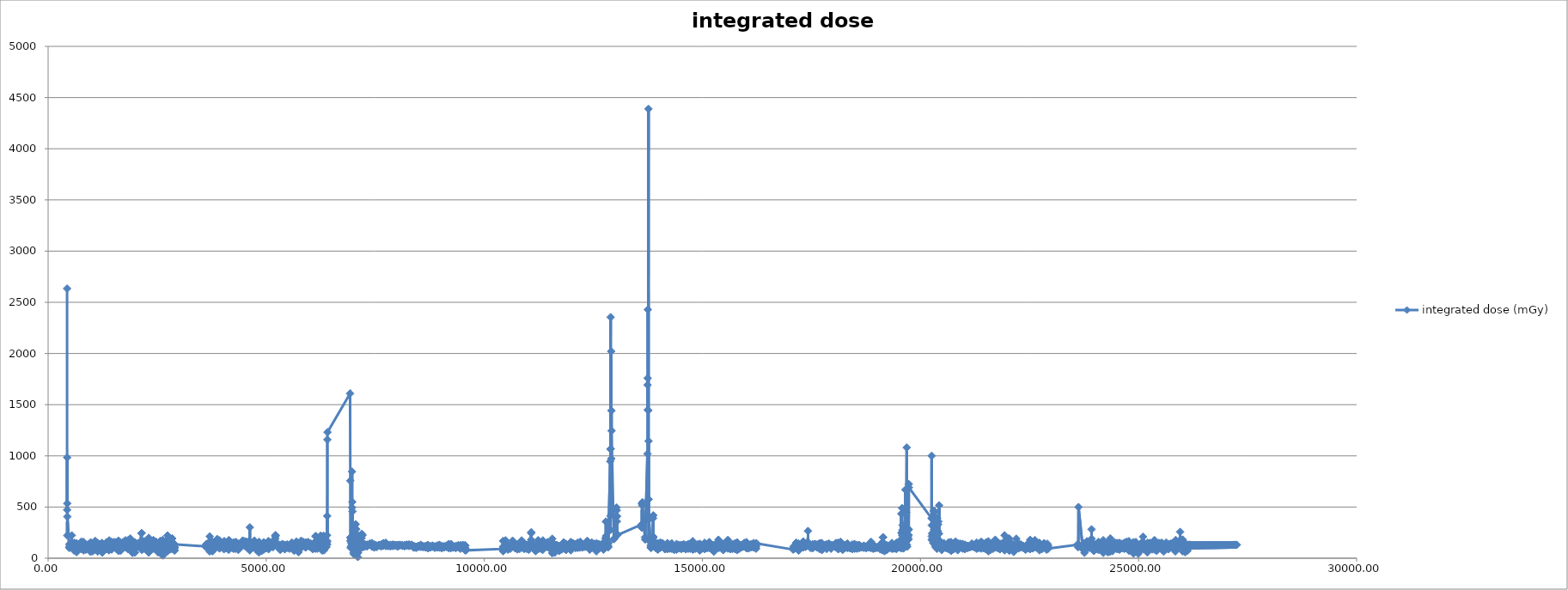
| Category | integrated dose (mGy) |
|---|---|
| 434.416 | 2634.265 |
| 435.828 | 471.512 |
| 436.828 | 983.38 |
| 439.0 | 534.577 |
| 439.071 | 222.272 |
| 441.571 | 406.166 |
| 486.051 | 101.11 |
| 489.141 | 133.559 |
| 490.051 | 104.992 |
| 491.251 | 139.493 |
| 492.551 | 112.292 |
| 495.051 | 115.567 |
| 539.51 | 121.699 |
| 542.591 | 223.087 |
| 543.501 | 123.056 |
| 544.701 | 136.251 |
| 546.001 | 143.438 |
| 548.501 | 109.413 |
| 592.951 | 75.959 |
| 596.041 | 115.371 |
| 596.951 | 112.439 |
| 598.151 | 100.381 |
| 599.451 | 150.574 |
| 601.951 | 124.471 |
| 646.401 | 120.084 |
| 649.491 | 145.872 |
| 650.401 | 138.666 |
| 651.601 | 118.229 |
| 652.901 | 59.514 |
| 655.401 | 140.295 |
| 699.851 | 118.128 |
| 702.941 | 101.698 |
| 703.851 | 112.302 |
| 705.051 | 103.639 |
| 706.351 | 102.604 |
| 708.851 | 88.791 |
| 753.301 | 112.662 |
| 756.391 | 117.782 |
| 757.301 | 160.199 |
| 758.501 | 100.605 |
| 759.801 | 89.321 |
| 762.301 | 160.143 |
| 806.751 | 159.998 |
| 809.841 | 145.849 |
| 810.751 | 143.346 |
| 811.951 | 76.221 |
| 813.251 | 105.544 |
| 815.751 | 107.265 |
| 860.201 | 103.504 |
| 863.291 | 82.973 |
| 864.201 | 90.004 |
| 865.401 | 129.115 |
| 866.701 | 133.452 |
| 869.201 | 92.039 |
| 913.651 | 130.34 |
| 916.741 | 89.072 |
| 917.651 | 96.466 |
| 918.851 | 98.555 |
| 920.151 | 134.952 |
| 922.651 | 125.811 |
| 967.101 | 113.897 |
| 970.191 | 137.633 |
| 971.101 | 95.167 |
| 972.301 | 139.3 |
| 973.601 | 62.251 |
| 976.101 | 155.574 |
| 1020.551 | 141.674 |
| 1023.641 | 134.713 |
| 1024.551 | 67.525 |
| 1025.751 | 132.56 |
| 1027.051 | 142.817 |
| 1029.551 | 81.951 |
| 1074.001 | 85.234 |
| 1077.091 | 127.6 |
| 1078.001 | 148.004 |
| 1079.201 | 165.537 |
| 1080.501 | 168.222 |
| 1083.001 | 137.644 |
| 1127.451 | 93.606 |
| 1130.541 | 128.58 |
| 1131.451 | 77.428 |
| 1132.651 | 143.335 |
| 1133.951 | 149.246 |
| 1136.451 | 65.368 |
| 1180.901 | 138.966 |
| 1183.991 | 106.212 |
| 1184.901 | 128.62 |
| 1186.101 | 95.247 |
| 1187.401 | 111.777 |
| 1189.901 | 79.179 |
| 1234.351 | 149.757 |
| 1237.441 | 129.431 |
| 1238.351 | 116.01 |
| 1239.551 | 113.458 |
| 1240.851 | 91.842 |
| 1243.351 | 54.996 |
| 1287.801 | 106.175 |
| 1290.891 | 102.723 |
| 1291.801 | 123.551 |
| 1293.001 | 132.675 |
| 1294.301 | 115.482 |
| 1296.801 | 118.488 |
| 1341.251 | 156.964 |
| 1344.341 | 90.107 |
| 1345.251 | 104.69 |
| 1346.451 | 89.968 |
| 1347.751 | 106.324 |
| 1350.251 | 120.274 |
| 1394.701 | 77.025 |
| 1397.791 | 163.706 |
| 1398.701 | 88.13 |
| 1399.901 | 86.082 |
| 1401.201 | 174.275 |
| 1403.701 | 112.549 |
| 1448.151 | 160.455 |
| 1451.241 | 104.278 |
| 1452.151 | 127.108 |
| 1453.351 | 130.939 |
| 1454.651 | 90.383 |
| 1457.151 | 85.223 |
| 1501.601 | 133.005 |
| 1504.691 | 136.102 |
| 1505.601 | 105.733 |
| 1506.801 | 132.096 |
| 1508.101 | 141.842 |
| 1510.601 | 157.438 |
| 1555.051 | 125.566 |
| 1558.141 | 157.466 |
| 1559.051 | 115.36 |
| 1560.251 | 137.221 |
| 1561.551 | 132.189 |
| 1564.051 | 90.765 |
| 1608.501 | 89.423 |
| 1611.591 | 71.746 |
| 1612.501 | 171.17 |
| 1613.701 | 82.844 |
| 1615.001 | 140.551 |
| 1617.501 | 74.773 |
| 1661.951 | 72.735 |
| 1665.041 | 137.62 |
| 1665.951 | 136.028 |
| 1667.151 | 152.172 |
| 1668.451 | 133.041 |
| 1670.951 | 135.709 |
| 1715.401 | 151.791 |
| 1718.491 | 124.335 |
| 1719.401 | 121.189 |
| 1720.601 | 157.244 |
| 1721.901 | 117.234 |
| 1724.401 | 146.467 |
| 1768.851 | 117.725 |
| 1771.941 | 113.981 |
| 1772.851 | 175.276 |
| 1774.051 | 109.582 |
| 1775.351 | 142.746 |
| 1777.851 | 104.616 |
| 1822.301 | 102.09 |
| 1825.391 | 156.002 |
| 1826.301 | 95.481 |
| 1827.501 | 163.291 |
| 1828.801 | 90.033 |
| 1831.301 | 175.285 |
| 1875.751 | 129.774 |
| 1878.841 | 87.259 |
| 1879.751 | 128.766 |
| 1880.951 | 167.907 |
| 1882.251 | 151.416 |
| 1884.751 | 192.911 |
| 1929.201 | 94.343 |
| 1932.291 | 125.956 |
| 1933.201 | 52.863 |
| 1933.201 | 52.863 |
| 1934.401 | 114.647 |
| 1934.401 | 114.647 |
| 1935.701 | 99.59 |
| 1935.701 | 99.59 |
| 1938.201 | 131.882 |
| 1938.201 | 131.882 |
| 1982.651 | 155.531 |
| 1982.651 | 155.531 |
| 1985.741 | 111.823 |
| 1985.741 | 111.823 |
| 1986.651 | 139.927 |
| 1986.651 | 139.927 |
| 1987.851 | 57.175 |
| 1987.851 | 57.175 |
| 1989.151 | 127.089 |
| 1989.151 | 127.089 |
| 1991.651 | 107.379 |
| 1991.651 | 107.379 |
| 2036.101 | 139.126 |
| 2036.101 | 139.126 |
| 2039.191 | 127.003 |
| 2039.191 | 127.003 |
| 2040.101 | 136.719 |
| 2040.101 | 136.719 |
| 2041.301 | 112.154 |
| 2041.301 | 112.154 |
| 2042.601 | 122.704 |
| 2042.601 | 122.704 |
| 2045.101 | 140.187 |
| 2045.101 | 140.187 |
| 2089.551 | 120.514 |
| 2089.551 | 120.514 |
| 2092.641 | 151.911 |
| 2092.641 | 151.911 |
| 2093.551 | 122.878 |
| 2093.551 | 122.878 |
| 2094.751 | 121.798 |
| 2094.751 | 121.798 |
| 2096.051 | 114.103 |
| 2096.051 | 114.103 |
| 2098.551 | 121.284 |
| 2098.551 | 121.284 |
| 2143.001 | 244.775 |
| 2143.001 | 244.775 |
| 2146.091 | 132.859 |
| 2146.091 | 132.859 |
| 2147.001 | 99.68 |
| 2147.001 | 99.68 |
| 2148.201 | 84.02 |
| 2148.201 | 84.02 |
| 2149.501 | 129.348 |
| 2149.501 | 129.348 |
| 2152.001 | 87.442 |
| 2152.001 | 87.442 |
| 2196.451 | 114.822 |
| 2196.451 | 114.822 |
| 2199.541 | 129.076 |
| 2199.541 | 129.076 |
| 2200.451 | 164.845 |
| 2200.451 | 164.845 |
| 2201.651 | 95.185 |
| 2201.651 | 95.185 |
| 2202.951 | 142 |
| 2202.951 | 142 |
| 2205.451 | 131.051 |
| 2205.451 | 131.051 |
| 2249.901 | 129.196 |
| 2249.901 | 129.196 |
| 2252.991 | 100.175 |
| 2252.991 | 100.175 |
| 2253.901 | 104.688 |
| 2253.901 | 104.688 |
| 2255.101 | 124.876 |
| 2255.101 | 124.876 |
| 2256.401 | 172.5 |
| 2256.401 | 172.5 |
| 2258.901 | 143.945 |
| 2258.901 | 143.945 |
| 2303.351 | 124.607 |
| 2303.351 | 124.607 |
| 2306.441 | 198.001 |
| 2306.441 | 198.001 |
| 2307.351 | 57.319 |
| 2307.351 | 57.319 |
| 2308.551 | 133.638 |
| 2308.551 | 133.638 |
| 2309.851 | 91.382 |
| 2309.851 | 91.382 |
| 2312.351 | 67.83 |
| 2312.351 | 67.83 |
| 2356.801 | 109.701 |
| 2356.801 | 109.701 |
| 2359.891 | 103.685 |
| 2359.891 | 103.685 |
| 2360.801 | 107.795 |
| 2360.801 | 107.795 |
| 2362.001 | 132.546 |
| 2362.001 | 132.546 |
| 2363.301 | 154.169 |
| 2363.301 | 154.169 |
| 2365.801 | 112.531 |
| 2365.801 | 112.531 |
| 2410.251 | 144.787 |
| 2410.251 | 144.787 |
| 2413.341 | 130.629 |
| 2413.341 | 130.629 |
| 2414.251 | 175.527 |
| 2414.251 | 175.527 |
| 2415.451 | 112.61 |
| 2415.451 | 112.61 |
| 2416.751 | 95.119 |
| 2416.751 | 95.119 |
| 2419.251 | 104.549 |
| 2419.251 | 104.549 |
| 2463.701 | 151.939 |
| 2463.701 | 151.939 |
| 2466.791 | 129.534 |
| 2466.791 | 129.534 |
| 2467.701 | 102.852 |
| 2467.701 | 102.852 |
| 2468.901 | 141.651 |
| 2468.901 | 141.651 |
| 2470.201 | 161.795 |
| 2470.201 | 161.795 |
| 2472.701 | 121.04 |
| 2472.701 | 121.04 |
| 2517.151 | 108.858 |
| 2517.151 | 108.858 |
| 2520.241 | 93.509 |
| 2520.241 | 93.509 |
| 2521.151 | 107.132 |
| 2521.151 | 107.132 |
| 2522.351 | 59.597 |
| 2522.351 | 59.597 |
| 2523.651 | 114.63 |
| 2523.651 | 114.63 |
| 2526.151 | 110.449 |
| 2526.151 | 110.449 |
| 2570.601 | 164.253 |
| 2570.601 | 164.253 |
| 2573.691 | 165.895 |
| 2573.691 | 165.895 |
| 2574.601 | 100.608 |
| 2574.601 | 100.608 |
| 2575.801 | 99.324 |
| 2575.801 | 99.324 |
| 2577.101 | 53.515 |
| 2577.101 | 53.515 |
| 2579.601 | 126.718 |
| 2579.601 | 126.718 |
| 2624.051 | 49.027 |
| 2624.051 | 49.027 |
| 2627.141 | 177.093 |
| 2627.141 | 177.093 |
| 2628.051 | 69.035 |
| 2628.051 | 69.035 |
| 2629.251 | 28.201 |
| 2629.251 | 28.201 |
| 2630.551 | 87.403 |
| 2630.551 | 87.403 |
| 2633.051 | 163.946 |
| 2633.051 | 163.946 |
| 2677.501 | 140.605 |
| 2677.501 | 140.605 |
| 2680.591 | 160.068 |
| 2680.591 | 160.068 |
| 2681.501 | 130.483 |
| 2681.501 | 130.483 |
| 2682.701 | 87.697 |
| 2682.701 | 87.697 |
| 2684.001 | 108.58 |
| 2684.001 | 108.58 |
| 2686.501 | 148.762 |
| 2686.501 | 148.762 |
| 2730.951 | 92.138 |
| 2730.951 | 92.138 |
| 2734.041 | 106.932 |
| 2734.041 | 106.932 |
| 2734.951 | 116.862 |
| 2734.951 | 116.862 |
| 2736.151 | 68.445 |
| 2736.151 | 68.445 |
| 2737.451 | 221.434 |
| 2737.451 | 221.434 |
| 2739.951 | 112.599 |
| 2739.951 | 112.599 |
| 2784.401 | 115.414 |
| 2784.401 | 115.414 |
| 2787.491 | 118.215 |
| 2787.491 | 118.215 |
| 2788.401 | 86.873 |
| 2788.401 | 86.873 |
| 2789.601 | 122.942 |
| 2789.601 | 122.942 |
| 2790.901 | 126.66 |
| 2790.901 | 126.66 |
| 2793.401 | 137.809 |
| 2793.401 | 137.809 |
| 2837.851 | 91.777 |
| 2837.851 | 91.777 |
| 2840.941 | 120.483 |
| 2840.941 | 120.483 |
| 2841.851 | 122.098 |
| 2841.851 | 122.098 |
| 2843.051 | 102.294 |
| 2843.051 | 102.294 |
| 2844.351 | 192.735 |
| 2844.351 | 192.735 |
| 2846.851 | 97.869 |
| 2846.851 | 97.869 |
| 2891.301 | 96.167 |
| 2891.301 | 96.167 |
| 2894.391 | 109.267 |
| 2894.391 | 109.267 |
| 2895.803 | 100.14 |
| 2895.803 | 100.14 |
| 2896.803 | 99.529 |
| 2896.803 | 99.529 |
| 2899.046 | 76.238 |
| 2899.046 | 76.238 |
| 2901.546 | 135.529 |
| 2901.546 | 135.529 |
| 3608.025 | 115.584 |
| 3613.225 | 118.687 |
| 3618.685 | 109.99 |
| 3622.535 | 131.633 |
| 3625.985 | 113.12 |
| 3629.635 | 138.151 |
| 3701.28 | 134.244 |
| 3703.38 | 66.543 |
| 3705.48 | 212.775 |
| 3707.58 | 80.094 |
| 3709.68 | 167.717 |
| 3711.78 | 126.836 |
| 3726.62 | 111.386 |
| 3731.82 | 138.027 |
| 3737.28 | 151.352 |
| 3742.28 | 172.913 |
| 3747.48 | 108.277 |
| 3750.24 | 80.111 |
| 3752.94 | 148.894 |
| 3763.255 | 82.98 |
| 3766.345 | 99.458 |
| 3767.758 | 67.384 |
| 3768.758 | 113.762 |
| 3771.0 | 128.97 |
| 3773.5 | 78.021 |
| 3812.78 | 122.534 |
| 3814.88 | 127.726 |
| 3817.98 | 120.557 |
| 3821.07 | 130.123 |
| 3821.98 | 128.979 |
| 3823.18 | 94.538 |
| 3824.48 | 106.689 |
| 3826.98 | 134.813 |
| 3871.43 | 125.197 |
| 3874.52 | 174.249 |
| 3875.43 | 115.191 |
| 3876.63 | 187.453 |
| 3877.93 | 111.159 |
| 3880.43 | 118.173 |
| 3924.88 | 174.789 |
| 3927.97 | 139.078 |
| 3928.88 | 154.366 |
| 3930.08 | 95.241 |
| 3931.38 | 164.61 |
| 3933.88 | 106.926 |
| 3978.33 | 124.063 |
| 3981.42 | 139.862 |
| 3982.33 | 142.941 |
| 3983.53 | 136.412 |
| 3984.83 | 144.394 |
| 3987.33 | 128.433 |
| 4031.78 | 88.06 |
| 4034.87 | 159.92 |
| 4035.78 | 95.139 |
| 4036.98 | 158.361 |
| 4038.28 | 167.391 |
| 4040.78 | 98.076 |
| 4085.23 | 130.153 |
| 4088.32 | 102.356 |
| 4089.23 | 140.94 |
| 4090.43 | 130.478 |
| 4091.73 | 96.229 |
| 4094.23 | 101.735 |
| 4138.68 | 83.104 |
| 4141.77 | 86.326 |
| 4142.68 | 95.482 |
| 4143.88 | 145.422 |
| 4145.18 | 177.698 |
| 4147.68 | 104.023 |
| 4192.13 | 118.6 |
| 4195.22 | 101.9 |
| 4196.13 | 128.696 |
| 4197.33 | 141.852 |
| 4198.63 | 148.949 |
| 4201.13 | 123.203 |
| 4245.58 | 149.146 |
| 4248.67 | 154.103 |
| 4249.58 | 120.459 |
| 4250.78 | 124.825 |
| 4252.08 | 91.453 |
| 4254.58 | 95.87 |
| 4299.03 | 91.963 |
| 4302.12 | 152.223 |
| 4303.03 | 158.274 |
| 4304.23 | 139.196 |
| 4305.53 | 124.013 |
| 4308.03 | 98.93 |
| 4352.48 | 144.31 |
| 4355.57 | 115.875 |
| 4356.48 | 132.963 |
| 4357.68 | 95.072 |
| 4358.98 | 100.681 |
| 4361.48 | 81.425 |
| 4405.93 | 114.61 |
| 4409.02 | 107.89 |
| 4409.93 | 122.033 |
| 4411.13 | 112.484 |
| 4412.43 | 121.262 |
| 4414.93 | 113.16 |
| 4459.38 | 135.002 |
| 4462.47 | 172.824 |
| 4463.38 | 132.969 |
| 4464.58 | 130.674 |
| 4465.88 | 129.342 |
| 4468.38 | 126.771 |
| 4512.83 | 161.887 |
| 4515.92 | 117.448 |
| 4516.83 | 141.853 |
| 4518.03 | 165.205 |
| 4519.33 | 142.853 |
| 4521.83 | 141.58 |
| 4566.28 | 118.91 |
| 4569.37 | 157.513 |
| 4570.28 | 126.713 |
| 4571.48 | 106.211 |
| 4572.78 | 101.074 |
| 4575.28 | 158.045 |
| 4619.73 | 137.009 |
| 4622.82 | 123.5 |
| 4623.73 | 76.506 |
| 4624.93 | 301.693 |
| 4626.23 | 160.939 |
| 4628.73 | 119.379 |
| 4673.18 | 104.774 |
| 4676.27 | 152.183 |
| 4677.18 | 144.989 |
| 4678.38 | 135.295 |
| 4679.68 | 100.387 |
| 4682.18 | 134.824 |
| 4726.63 | 128.47 |
| 4729.72 | 136.071 |
| 4730.63 | 172.284 |
| 4731.83 | 123.234 |
| 4733.13 | 140.133 |
| 4735.63 | 135.569 |
| 4780.08 | 96.573 |
| 4783.17 | 139.878 |
| 4784.08 | 77.558 |
| 4785.28 | 98.772 |
| 4786.58 | 95.033 |
| 4789.08 | 97.842 |
| 4833.53 | 56.038 |
| 4836.62 | 160.536 |
| 4837.53 | 95.419 |
| 4838.73 | 129.396 |
| 4840.03 | 132.822 |
| 4842.53 | 94.46 |
| 4886.98 | 86.682 |
| 4890.07 | 78.409 |
| 4890.98 | 98.785 |
| 4892.18 | 104.562 |
| 4893.48 | 84.302 |
| 4895.98 | 70.445 |
| 4940.43 | 145.012 |
| 4943.52 | 156.999 |
| 4944.43 | 84.208 |
| 4945.63 | 138.672 |
| 4946.93 | 122.244 |
| 4949.43 | 128.821 |
| 4993.88 | 100.465 |
| 4996.97 | 96.529 |
| 4997.88 | 144.006 |
| 4999.08 | 105.17 |
| 5000.38 | 110.92 |
| 5002.88 | 115.135 |
| 5047.33 | 128.682 |
| 5050.42 | 167.56 |
| 5051.33 | 114.34 |
| 5052.53 | 120.67 |
| 5053.83 | 87.745 |
| 5056.33 | 116.956 |
| 5100.78 | 132.193 |
| 5103.87 | 117.173 |
| 5104.78 | 132.156 |
| 5105.98 | 150.621 |
| 5107.28 | 135.367 |
| 5109.78 | 124.275 |
| 5154.23 | 106.707 |
| 5157.32 | 117.92 |
| 5158.23 | 141.327 |
| 5159.43 | 138.729 |
| 5160.73 | 143.271 |
| 5163.23 | 167.777 |
| 5207.68 | 188.91 |
| 5210.77 | 210.838 |
| 5211.68 | 139.221 |
| 5212.88 | 223.198 |
| 5214.18 | 156.444 |
| 5216.68 | 224.838 |
| 5261.13 | 110.899 |
| 5264.22 | 126.401 |
| 5265.13 | 139.501 |
| 5266.33 | 131.121 |
| 5267.63 | 121.871 |
| 5270.13 | 123.371 |
| 5314.58 | 117.4 |
| 5317.67 | 131.087 |
| 5318.58 | 111.512 |
| 5319.78 | 111.278 |
| 5321.08 | 80.958 |
| 5323.58 | 97.892 |
| 5368.03 | 121.713 |
| 5371.12 | 124.603 |
| 5372.03 | 117.703 |
| 5373.23 | 139.794 |
| 5374.53 | 122.24 |
| 5377.03 | 113.271 |
| 5421.48 | 104.857 |
| 5424.57 | 114.105 |
| 5425.48 | 87.165 |
| 5426.68 | 131.142 |
| 5427.98 | 125.473 |
| 5430.48 | 117.607 |
| 5474.93 | 121.173 |
| 5478.02 | 130.07 |
| 5478.93 | 101.768 |
| 5480.13 | 132.521 |
| 5481.43 | 107.181 |
| 5483.93 | 133.847 |
| 5528.38 | 112.912 |
| 5531.47 | 97.152 |
| 5532.38 | 93.145 |
| 5533.58 | 119.317 |
| 5534.88 | 110.387 |
| 5537.38 | 113.315 |
| 5581.83 | 126.659 |
| 5584.92 | 123.162 |
| 5585.83 | 110.774 |
| 5587.03 | 153.369 |
| 5588.33 | 137.216 |
| 5590.83 | 107.75 |
| 5635.28 | 102.121 |
| 5638.37 | 124.451 |
| 5639.28 | 127.14 |
| 5640.48 | 72.362 |
| 5641.78 | 122.991 |
| 5644.28 | 97.978 |
| 5688.73 | 132.181 |
| 5691.82 | 162.04 |
| 5692.73 | 119.284 |
| 5693.93 | 115.263 |
| 5695.23 | 136.825 |
| 5697.73 | 118.803 |
| 5742.18 | 59.328 |
| 5745.27 | 124.067 |
| 5746.18 | 135.671 |
| 5747.38 | 124.963 |
| 5748.68 | 136.18 |
| 5751.18 | 127.08 |
| 5795.63 | 119.643 |
| 5798.72 | 150.819 |
| 5799.63 | 108.17 |
| 5800.83 | 100.937 |
| 5802.13 | 171.267 |
| 5804.63 | 110.913 |
| 5849.08 | 124.62 |
| 5852.17 | 158.7 |
| 5853.08 | 131.173 |
| 5854.28 | 123.576 |
| 5855.58 | 128.784 |
| 5858.08 | 128.476 |
| 5902.53 | 104.589 |
| 5905.62 | 135.365 |
| 5906.53 | 109.493 |
| 5907.73 | 146.782 |
| 5909.03 | 154.521 |
| 5911.53 | 120.056 |
| 5955.98 | 120.504 |
| 5959.07 | 132.058 |
| 5959.98 | 119.391 |
| 5961.18 | 158.143 |
| 5962.48 | 123.529 |
| 5964.98 | 129.819 |
| 6009.43 | 116.026 |
| 6012.52 | 114.008 |
| 6013.43 | 126.484 |
| 6014.63 | 106.419 |
| 6015.93 | 145.797 |
| 6018.43 | 115.321 |
| 6062.88 | 120.224 |
| 6065.97 | 102.556 |
| 6066.88 | 88.501 |
| 6068.08 | 135.853 |
| 6069.38 | 129.091 |
| 6071.88 | 132.477 |
| 6116.33 | 102.616 |
| 6119.42 | 119.87 |
| 6120.33 | 104.639 |
| 6121.53 | 106.978 |
| 6122.83 | 101.175 |
| 6125.33 | 92.765 |
| 6130.221 | 216.622 |
| 6137.721 | 212.696 |
| 6145.221 | 213.484 |
| 6152.311 | 174.972 |
| 6169.78 | 92.785 |
| 6172.87 | 115.939 |
| 6173.78 | 111.619 |
| 6174.98 | 111.755 |
| 6176.28 | 118.545 |
| 6178.78 | 100.151 |
| 6223.23 | 113.915 |
| 6226.32 | 130.313 |
| 6226.32 | 104.584 |
| 6228.733 | 118.065 |
| 6228.803 | 106.696 |
| 6230.975 | 120.901 |
| 6233.475 | 133.902 |
| 6249.221 | 220.831 |
| 6254.221 | 209.089 |
| 6258.541 | 170.257 |
| 6263.391 | 199.423 |
| 6268.521 | 177.023 |
| 6273.521 | 169.415 |
| 6276.012 | 190.902 |
| 6279.102 | 90.827 |
| 6281.414 | 88.963 |
| 6281.714 | 96.325 |
| 6283.757 | 74.769 |
| 6286.257 | 94.997 |
| 6288.471 | 149.951 |
| 6295.971 | 182.342 |
| 6303.471 | 175.695 |
| 6310.971 | 163.135 |
| 6315.077 | 220.447 |
| 6318.167 | 86.061 |
| 6320.999 | 90.359 |
| 6321.309 | 104.051 |
| 6324.222 | 132.527 |
| 6326.722 | 77.389 |
| 6329.221 | 199.289 |
| 6331.721 | 105.696 |
| 6334.221 | 145.722 |
| 6336.721 | 124.452 |
| 6339.221 | 99.981 |
| 6341.931 | 103.902 |
| 6344.221 | 127.662 |
| 6349.421 | 208.08 |
| 6355.542 | 128.848 |
| 6358.632 | 143.116 |
| 6360.044 | 159.505 |
| 6361.244 | 108.752 |
| 6363.287 | 124.057 |
| 6365.787 | 112.528 |
| 6367.957 | 135.253 |
| 6371.607 | 105.749 |
| 6375.257 | 113.738 |
| 6378.907 | 134.109 |
| 6384.367 | 152.024 |
| 6389.567 | 132.69 |
| 6394.567 | 224.187 |
| 6397.697 | 134.801 |
| 6399.195 | 412.138 |
| 6400.721 | 167.061 |
| 6402.312 | 1158.126 |
| 6405.862 | 1231.463 |
| 6923.08 | 1608.38 |
| 6927.76 | 757.152 |
| 6929.584 | 169.71 |
| 6930.784 | 203.032 |
| 6932.375 | 103.608 |
| 6934.875 | 197.454 |
| 6939.875 | 171.631 |
| 6945.075 | 205.903 |
| 6950.535 | 119.661 |
| 6954.185 | 149.508 |
| 6957.835 | 185.22 |
| 6961.485 | 211.29 |
| 6963.735 | 139.451 |
| 6966.825 | 846.04 |
| 6968.237 | 124.456 |
| 6969.437 | 495.306 |
| 6971.48 | 201.837 |
| 6973.98 | 550.297 |
| 6979.721 | 457.601 |
| 6985.221 | 180.014 |
| 6987.221 | 148.534 |
| 6990.191 | 172.366 |
| 6992.721 | 127.932 |
| 6995.221 | 169.598 |
| 6997.721 | 162.826 |
| 7000.221 | 275.163 |
| 7002.8 | 55.913 |
| 7005.89 | 281.558 |
| 7008.032 | 40.478 |
| 7009.032 | 127.897 |
| 7011.945 | 80.872 |
| 7014.445 | 251.138 |
| 7018.471 | 222.185 |
| 7025.791 | 170.517 |
| 7033.471 | 216.539 |
| 7040.971 | 201.365 |
| 7043.265 | 125.921 |
| 7046.355 | 123.363 |
| 7047.767 | 90.585 |
| 7048.967 | 169.059 |
| 7051.01 | 107.474 |
| 7053.51 | 332.122 |
| 7055.141 | 219.817 |
| 7060.541 | 231.62 |
| 7065.941 | 283.054 |
| 7070.821 | 205.963 |
| 7075.121 | 234.258 |
| 7080.221 | 157.878 |
| 7096.047 | 50.445 |
| 7099.136 | 167.824 |
| 7100.549 | 12.017 |
| 7101.549 | 85.909 |
| 7103.721 | 69.736 |
| 7103.792 | 81.323 |
| 7106.292 | 53.06 |
| 7150.771 | 111.556 |
| 7153.861 | 114.526 |
| 7154.771 | 100.817 |
| 7155.971 | 105.038 |
| 7157.271 | 110.225 |
| 7159.771 | 109.445 |
| 7177.041 | 218.139 |
| 7184.221 | 196.317 |
| 7191.521 | 237.238 |
| 7199.221 | 230.547 |
| 7204.221 | 115.048 |
| 7207.311 | 224.034 |
| 7208.221 | 117.86 |
| 7209.422 | 123.384 |
| 7210.721 | 106.635 |
| 7213.221 | 113.218 |
| 7257.672 | 131.793 |
| 7260.761 | 130.326 |
| 7261.672 | 127.41 |
| 7262.872 | 114.568 |
| 7264.172 | 136.961 |
| 7266.672 | 128.367 |
| 7311.122 | 126.586 |
| 7314.212 | 114.356 |
| 7315.122 | 126.374 |
| 7316.322 | 129.968 |
| 7317.622 | 133.133 |
| 7320.122 | 124.025 |
| 7364.572 | 135.35 |
| 7367.662 | 138.94 |
| 7368.572 | 134.892 |
| 7369.771 | 133.465 |
| 7371.072 | 138.274 |
| 7373.572 | 143.127 |
| 7418.021 | 125.382 |
| 7421.111 | 136.604 |
| 7422.021 | 148.713 |
| 7423.221 | 129.741 |
| 7424.521 | 112.969 |
| 7427.021 | 133.048 |
| 7471.471 | 116.8 |
| 7474.561 | 129.616 |
| 7475.471 | 126.087 |
| 7476.672 | 103.976 |
| 7477.971 | 119.163 |
| 7480.471 | 133.795 |
| 7491.542 | 113.696 |
| 7495.54 | 120.246 |
| 7511.27 | 129.104 |
| 7522.862 | 113.951 |
| 7524.922 | 112.523 |
| 7528.011 | 121.047 |
| 7528.922 | 117.899 |
| 7530.122 | 113.959 |
| 7531.422 | 123.112 |
| 7533.922 | 109.76 |
| 7578.372 | 127.824 |
| 7581.462 | 128.686 |
| 7582.372 | 126.578 |
| 7583.572 | 126.963 |
| 7584.872 | 130.89 |
| 7587.372 | 127.568 |
| 7631.822 | 124.592 |
| 7634.912 | 126.354 |
| 7635.822 | 114.301 |
| 7637.021 | 135.302 |
| 7638.322 | 125.035 |
| 7640.822 | 123.919 |
| 7685.271 | 121.695 |
| 7688.361 | 147.611 |
| 7689.271 | 122.455 |
| 7690.471 | 144.543 |
| 7691.771 | 128.199 |
| 7694.271 | 131.956 |
| 7738.721 | 124.456 |
| 7741.811 | 128.618 |
| 7742.721 | 150.893 |
| 7743.922 | 122.075 |
| 7745.221 | 119.412 |
| 7747.721 | 122.15 |
| 7792.172 | 118.377 |
| 7795.261 | 125.975 |
| 7796.172 | 125.563 |
| 7797.372 | 121.862 |
| 7798.672 | 127.057 |
| 7801.172 | 125.96 |
| 7845.622 | 116.232 |
| 7848.712 | 125.26 |
| 7849.622 | 131.731 |
| 7850.822 | 124.807 |
| 7852.122 | 124.373 |
| 7854.622 | 117.973 |
| 7899.072 | 121.885 |
| 7902.162 | 126.926 |
| 7903.072 | 130.413 |
| 7904.271 | 119.121 |
| 7905.572 | 121.864 |
| 7908.072 | 134.351 |
| 7952.521 | 127.809 |
| 7955.611 | 127.775 |
| 7956.521 | 126.894 |
| 7957.721 | 129.132 |
| 7959.021 | 128.658 |
| 7961.521 | 128.095 |
| 8005.971 | 129.805 |
| 8009.061 | 124.196 |
| 8009.971 | 122.534 |
| 8011.172 | 112.844 |
| 8012.471 | 122.374 |
| 8014.971 | 129.858 |
| 8059.422 | 125.436 |
| 8062.511 | 131.279 |
| 8063.422 | 127.228 |
| 8064.622 | 129.743 |
| 8065.922 | 126.449 |
| 8068.422 | 125.167 |
| 8112.872 | 126.265 |
| 8115.962 | 129.874 |
| 8116.872 | 122.636 |
| 8118.072 | 124.945 |
| 8119.372 | 123.17 |
| 8121.872 | 125.092 |
| 8166.322 | 122.214 |
| 8169.412 | 126.471 |
| 8170.322 | 115.988 |
| 8171.521 | 122.459 |
| 8172.822 | 128.115 |
| 8175.322 | 121.024 |
| 8219.772 | 131.394 |
| 8222.862 | 127.559 |
| 8223.772 | 122.445 |
| 8224.971 | 124.434 |
| 8226.272 | 132.023 |
| 8228.772 | 126.418 |
| 8273.221 | 120.225 |
| 8276.311 | 132.018 |
| 8277.221 | 134.254 |
| 8278.422 | 127.628 |
| 8279.721 | 119.923 |
| 8282.221 | 125.636 |
| 8326.672 | 126.502 |
| 8329.762 | 128.451 |
| 8330.672 | 125.967 |
| 8331.871 | 122.007 |
| 8333.172 | 126.381 |
| 8335.672 | 131.988 |
| 8380.121 | 111.688 |
| 8383.211 | 105.475 |
| 8384.121 | 120.077 |
| 8385.322 | 103.604 |
| 8386.621 | 117.111 |
| 8389.121 | 111.522 |
| 8433.572 | 106.966 |
| 8436.662 | 108.703 |
| 8437.572 | 114.525 |
| 8438.772 | 101.092 |
| 8440.072 | 107.385 |
| 8442.572 | 109.375 |
| 8487.022 | 116.037 |
| 8490.112 | 120.157 |
| 8491.022 | 122.089 |
| 8492.221 | 112.882 |
| 8493.522 | 110.44 |
| 8496.022 | 113.465 |
| 8540.471 | 116.809 |
| 8543.561 | 131.925 |
| 8544.471 | 115.207 |
| 8545.672 | 118.781 |
| 8546.971 | 110.756 |
| 8549.471 | 112.915 |
| 8593.922 | 107.942 |
| 8597.012 | 116.481 |
| 8597.922 | 113.921 |
| 8599.121 | 109.008 |
| 8600.422 | 117.266 |
| 8602.922 | 112.249 |
| 8647.371 | 105.833 |
| 8650.461 | 111.635 |
| 8651.371 | 119.446 |
| 8652.572 | 111.3 |
| 8653.871 | 115.238 |
| 8656.371 | 110.707 |
| 8700.822 | 101.841 |
| 8703.912 | 114.287 |
| 8704.822 | 130.271 |
| 8706.022 | 97.254 |
| 8707.322 | 115.443 |
| 8709.822 | 116.53 |
| 8754.272 | 102.996 |
| 8757.362 | 118.958 |
| 8758.272 | 110.366 |
| 8759.471 | 114.285 |
| 8760.772 | 111.647 |
| 8763.272 | 111.768 |
| 8807.721 | 110.909 |
| 8810.811 | 123.613 |
| 8811.721 | 119.632 |
| 8812.922 | 114.176 |
| 8814.221 | 116.695 |
| 8816.721 | 112.553 |
| 8861.172 | 116.481 |
| 8864.262 | 110.371 |
| 8865.172 | 108.871 |
| 8866.371 | 100.331 |
| 8867.672 | 110.092 |
| 8870.172 | 108.7 |
| 8914.621 | 115.583 |
| 8917.711 | 114.58 |
| 8918.621 | 110.179 |
| 8919.822 | 124.286 |
| 8921.121 | 112.388 |
| 8923.621 | 105.727 |
| 8968.072 | 130.555 |
| 8971.162 | 130.362 |
| 8972.072 | 103.068 |
| 8973.272 | 113.924 |
| 8974.572 | 113.548 |
| 8977.072 | 118.548 |
| 9021.522 | 110.927 |
| 9024.612 | 108.66 |
| 9025.522 | 97.915 |
| 9026.721 | 100.997 |
| 9028.022 | 117.179 |
| 9030.522 | 118.89 |
| 9074.971 | 114.748 |
| 9078.061 | 112.034 |
| 9078.971 | 105.819 |
| 9080.172 | 117.275 |
| 9081.471 | 107.668 |
| 9083.971 | 106.921 |
| 9128.422 | 119.765 |
| 9131.512 | 110.114 |
| 9132.422 | 112.758 |
| 9133.621 | 121.997 |
| 9134.922 | 113.396 |
| 9137.422 | 122.92 |
| 9181.871 | 117.17 |
| 9184.961 | 138.912 |
| 9185.871 | 97.416 |
| 9187.072 | 132.165 |
| 9188.371 | 114.075 |
| 9190.871 | 104.013 |
| 9235.322 | 97.657 |
| 9238.412 | 123.28 |
| 9239.322 | 128.358 |
| 9240.522 | 138.656 |
| 9241.822 | 117.194 |
| 9244.322 | 124.939 |
| 9288.772 | 106.876 |
| 9291.862 | 108.081 |
| 9292.772 | 104.057 |
| 9293.971 | 112.473 |
| 9295.272 | 116.058 |
| 9297.772 | 113.909 |
| 9342.221 | 116.09 |
| 9345.311 | 100.009 |
| 9346.221 | 102.181 |
| 9347.422 | 113.449 |
| 9348.721 | 100.564 |
| 9351.221 | 119.056 |
| 9395.672 | 125.201 |
| 9398.762 | 116.538 |
| 9399.672 | 106.666 |
| 9400.871 | 121.574 |
| 9402.172 | 119.043 |
| 9404.672 | 126.628 |
| 9449.121 | 104.927 |
| 9452.211 | 128.269 |
| 9453.121 | 92.604 |
| 9454.322 | 111.335 |
| 9455.621 | 117.477 |
| 9458.121 | 122.48 |
| 9502.572 | 99.614 |
| 9505.662 | 117.442 |
| 9506.572 | 130.684 |
| 9507.772 | 103.15 |
| 9509.072 | 100.427 |
| 9511.572 | 114.626 |
| 9556.022 | 126.668 |
| 9559.112 | 124.099 |
| 9560.524 | 98.355 |
| 9561.524 | 76.964 |
| 9563.766 | 99.074 |
| 9566.266 | 123.368 |
| 9579.181 | 76.952 |
| 10414.781 | 91.106 |
| 10427.976 | 90.406 |
| 10431.066 | 168.525 |
| 10432.478 | 68.243 |
| 10433.478 | 114.042 |
| 10435.721 | 76.811 |
| 10438.221 | 108.715 |
| 10482.701 | 94.831 |
| 10485.791 | 174.682 |
| 10486.701 | 140.385 |
| 10487.901 | 108.461 |
| 10489.201 | 155.057 |
| 10491.701 | 103.306 |
| 10536.151 | 99.603 |
| 10539.241 | 93.403 |
| 10540.151 | 84.286 |
| 10541.351 | 100.413 |
| 10542.651 | 109.219 |
| 10545.151 | 92.15 |
| 10589.601 | 116.878 |
| 10592.691 | 126.544 |
| 10593.601 | 108.796 |
| 10594.801 | 123.363 |
| 10596.101 | 92.183 |
| 10598.601 | 101.286 |
| 10643.051 | 149.994 |
| 10646.141 | 148.041 |
| 10647.051 | 144.707 |
| 10648.251 | 135.394 |
| 10649.551 | 171.446 |
| 10652.051 | 128.845 |
| 10696.501 | 109.737 |
| 10699.591 | 127.15 |
| 10700.501 | 102.288 |
| 10701.701 | 105.158 |
| 10703.001 | 110.531 |
| 10705.501 | 98.68 |
| 10749.951 | 104.366 |
| 10753.041 | 88.504 |
| 10753.951 | 113.312 |
| 10755.151 | 94.86 |
| 10756.451 | 86.474 |
| 10758.951 | 137.924 |
| 10803.401 | 97.712 |
| 10806.491 | 89.547 |
| 10807.401 | 120.432 |
| 10808.601 | 100.627 |
| 10809.901 | 101.363 |
| 10812.401 | 106.787 |
| 10856.851 | 173.814 |
| 10859.941 | 107.466 |
| 10860.851 | 109.39 |
| 10862.051 | 122.471 |
| 10863.351 | 102.933 |
| 10865.851 | 117.332 |
| 10910.301 | 106.774 |
| 10913.391 | 90.74 |
| 10914.301 | 94.554 |
| 10915.501 | 145.331 |
| 10916.801 | 113.412 |
| 10919.301 | 114.679 |
| 10963.751 | 110.661 |
| 10966.841 | 117.478 |
| 10967.751 | 125.65 |
| 10968.951 | 131.224 |
| 10970.251 | 91.596 |
| 10972.751 | 105.911 |
| 11017.201 | 131.393 |
| 11020.291 | 82.237 |
| 11021.201 | 100.97 |
| 11022.401 | 133.483 |
| 11023.701 | 115.228 |
| 11026.201 | 132.064 |
| 11070.651 | 160.054 |
| 11073.741 | 181.752 |
| 11074.651 | 244.793 |
| 11075.851 | 160.587 |
| 11077.151 | 254.565 |
| 11079.651 | 119.16 |
| 11124.101 | 118.351 |
| 11127.191 | 129.238 |
| 11128.101 | 122.078 |
| 11129.301 | 120.002 |
| 11130.601 | 118.958 |
| 11133.101 | 126.809 |
| 11177.551 | 68.899 |
| 11180.641 | 120.203 |
| 11181.551 | 117.779 |
| 11182.751 | 87.157 |
| 11184.051 | 101.631 |
| 11186.551 | 89.417 |
| 11231.001 | 106.529 |
| 11234.091 | 175.687 |
| 11235.001 | 126.898 |
| 11236.201 | 127.641 |
| 11237.501 | 88.958 |
| 11240.001 | 126.679 |
| 11284.451 | 119.823 |
| 11287.541 | 100.586 |
| 11288.451 | 131.304 |
| 11289.651 | 104.677 |
| 11290.951 | 125.542 |
| 11293.451 | 93.978 |
| 11337.901 | 80.846 |
| 11340.991 | 100.084 |
| 11341.901 | 123.224 |
| 11343.101 | 174.065 |
| 11344.401 | 102.144 |
| 11346.901 | 119.211 |
| 11391.351 | 131.588 |
| 11394.441 | 107.028 |
| 11395.351 | 142.294 |
| 11396.551 | 122.273 |
| 11397.851 | 144.891 |
| 11400.351 | 114.535 |
| 11444.801 | 116.234 |
| 11447.891 | 127.633 |
| 11448.801 | 157.162 |
| 11450.001 | 113.421 |
| 11451.301 | 109.213 |
| 11453.801 | 123.855 |
| 11498.251 | 99.672 |
| 11501.341 | 129.929 |
| 11502.251 | 112.166 |
| 11503.451 | 94.03 |
| 11504.751 | 112.283 |
| 11507.251 | 101.528 |
| 11551.701 | 104.923 |
| 11554.791 | 120.059 |
| 11555.701 | 49.317 |
| 11556.901 | 190.173 |
| 11558.201 | 130.503 |
| 11560.701 | 156.479 |
| 11605.151 | 92.873 |
| 11608.241 | 116.046 |
| 11609.151 | 130.483 |
| 11610.351 | 133.268 |
| 11611.651 | 53.092 |
| 11614.151 | 111.283 |
| 11658.601 | 127.092 |
| 11661.691 | 123.964 |
| 11662.601 | 90.264 |
| 11663.801 | 128.542 |
| 11665.101 | 128.73 |
| 11667.601 | 110.561 |
| 11712.051 | 116.894 |
| 11715.141 | 105.35 |
| 11716.051 | 70.776 |
| 11717.251 | 95.489 |
| 11718.551 | 100.119 |
| 11721.051 | 119.082 |
| 11765.501 | 100.113 |
| 11768.591 | 102.043 |
| 11769.501 | 123.678 |
| 11770.701 | 118.066 |
| 11772.001 | 109.709 |
| 11774.501 | 85.354 |
| 11818.951 | 126.007 |
| 11822.041 | 155.583 |
| 11822.951 | 118.882 |
| 11824.151 | 115.754 |
| 11825.451 | 107.203 |
| 11827.951 | 93.86 |
| 11872.401 | 121.207 |
| 11875.491 | 80.331 |
| 11876.401 | 102.39 |
| 11877.601 | 112.758 |
| 11878.901 | 139.428 |
| 11881.401 | 132.999 |
| 11925.851 | 119.324 |
| 11928.941 | 108.865 |
| 11929.851 | 110.554 |
| 11931.051 | 111.941 |
| 11932.351 | 102.624 |
| 11934.851 | 116.184 |
| 11979.301 | 147.105 |
| 11982.391 | 154.255 |
| 11983.301 | 96.726 |
| 11984.501 | 77.601 |
| 11985.801 | 157.921 |
| 11988.301 | 122.877 |
| 12032.751 | 115.145 |
| 12035.841 | 131.308 |
| 12036.751 | 132.094 |
| 12037.951 | 123.605 |
| 12039.251 | 138.591 |
| 12041.751 | 145.965 |
| 12086.201 | 116.028 |
| 12089.291 | 112.916 |
| 12090.201 | 137.081 |
| 12091.401 | 116.902 |
| 12092.701 | 99.555 |
| 12095.201 | 114.143 |
| 12139.651 | 151.801 |
| 12142.741 | 101.345 |
| 12143.651 | 121.687 |
| 12144.851 | 129.88 |
| 12146.151 | 128.952 |
| 12148.651 | 120.254 |
| 12193.101 | 147.868 |
| 12196.191 | 103.882 |
| 12197.101 | 115.936 |
| 12198.301 | 160.657 |
| 12199.601 | 112.95 |
| 12202.101 | 126.827 |
| 12246.551 | 127.678 |
| 12249.641 | 111.311 |
| 12250.551 | 104.191 |
| 12251.751 | 111.151 |
| 12253.051 | 135.014 |
| 12255.551 | 127.659 |
| 12300.001 | 126.422 |
| 12303.091 | 124.524 |
| 12304.001 | 133.027 |
| 12305.201 | 120.401 |
| 12306.501 | 126.366 |
| 12309.001 | 110.73 |
| 12353.451 | 147.321 |
| 12356.541 | 126.817 |
| 12357.451 | 126.388 |
| 12358.651 | 132.528 |
| 12359.951 | 170.173 |
| 12362.451 | 114.715 |
| 12406.901 | 110.16 |
| 12409.991 | 92.692 |
| 12410.901 | 132.61 |
| 12412.101 | 104.641 |
| 12413.401 | 95.812 |
| 12415.901 | 84.107 |
| 12460.351 | 119.974 |
| 12463.441 | 102.884 |
| 12464.351 | 118.865 |
| 12465.551 | 153.363 |
| 12466.851 | 107.655 |
| 12469.351 | 114.565 |
| 12513.801 | 97.202 |
| 12516.891 | 103.651 |
| 12517.801 | 101.966 |
| 12519.001 | 124.815 |
| 12520.301 | 141.154 |
| 12522.801 | 98.907 |
| 12567.251 | 68.577 |
| 12570.341 | 130.979 |
| 12571.251 | 83.655 |
| 12572.451 | 139.198 |
| 12573.751 | 146.488 |
| 12576.251 | 107.98 |
| 12620.701 | 121.392 |
| 12623.791 | 90.656 |
| 12624.701 | 136.184 |
| 12625.901 | 133.692 |
| 12627.201 | 138.385 |
| 12629.701 | 120.543 |
| 12674.151 | 119.074 |
| 12677.241 | 127.617 |
| 12678.151 | 110.031 |
| 12679.351 | 120.889 |
| 12680.651 | 131.453 |
| 12683.151 | 133.81 |
| 12727.601 | 120.155 |
| 12730.691 | 120.034 |
| 12731.601 | 83.631 |
| 12732.801 | 142.643 |
| 12734.101 | 152.659 |
| 12736.601 | 123.478 |
| 12781.051 | 190.126 |
| 12784.141 | 121.303 |
| 12785.051 | 199.887 |
| 12786.251 | 130.851 |
| 12787.551 | 357.602 |
| 12789.6 | 166.147 |
| 12790.051 | 108.205 |
| 12791.7 | 217.51 |
| 12834.501 | 116.907 |
| 12837.591 | 112.355 |
| 12838.501 | 105.554 |
| 12839.701 | 118.623 |
| 12841.001 | 154.313 |
| 12843.501 | 143.107 |
| 12887.951 | 946.005 |
| 12891.041 | 275.906 |
| 12892.453 | 1065.758 |
| 12893.453 | 412.817 |
| 12895.696 | 2354.371 |
| 12898.196 | 1068.772 |
| 12909.0 | 2020.883 |
| 12911.5 | 426.943 |
| 12913.2 | 973.321 |
| 12915.3 | 1441.546 |
| 12917.4 | 1245.148 |
| 12969.559 | 186.089 |
| 12974.759 | 189.096 |
| 13032.678 | 494.999 |
| 13036.328 | 468.153 |
| 13039.978 | 360.11 |
| 13043.628 | 409.892 |
| 13049.088 | 225.578 |
| 13054.288 | 231.919 |
| 13604.596 | 328.952 |
| 13609.796 | 297.712 |
| 13615.256 | 532.445 |
| 13618.906 | 518.316 |
| 13622.556 | 542.86 |
| 13626.206 | 545.976 |
| 13684.126 | 204.794 |
| 13689.326 | 182.732 |
| 13741.0 | 1019.765 |
| 13743.1 | 1692.286 |
| 13745.2 | 1758.911 |
| 13747.2 | 1449.175 |
| 13749.4 | 2428.393 |
| 13760.767 | 1443.769 |
| 13763.857 | 4389.293 |
| 13765.77 | 375.602 |
| 13765.78 | 1144.246 |
| 13768.0 | 576.035 |
| 13768.512 | 175.441 |
| 13771.012 | 398.115 |
| 13815.492 | 127.193 |
| 13818.582 | 156.111 |
| 13819.492 | 104.158 |
| 13820.692 | 102.869 |
| 13821.992 | 116.944 |
| 13824.492 | 101.205 |
| 13865.2 | 200.024 |
| 13867.3 | 195.681 |
| 13868.942 | 134.517 |
| 13872.032 | 390.156 |
| 13872.942 | 166.701 |
| 13874.142 | 418.711 |
| 13875.442 | 166.173 |
| 13877.942 | 209.69 |
| 13922.392 | 129.596 |
| 13925.482 | 101.112 |
| 13926.392 | 134.407 |
| 13927.592 | 114.218 |
| 13928.892 | 150.828 |
| 13931.392 | 122.532 |
| 13975.842 | 90.138 |
| 13978.932 | 83.819 |
| 13979.842 | 126.125 |
| 13981.042 | 146.577 |
| 13982.342 | 98.379 |
| 13984.842 | 133.315 |
| 14029.292 | 132.876 |
| 14032.382 | 101.33 |
| 14033.292 | 126.233 |
| 14034.492 | 130.824 |
| 14035.792 | 139.269 |
| 14038.292 | 154.393 |
| 14082.742 | 131.947 |
| 14085.832 | 137.436 |
| 14086.742 | 116.424 |
| 14087.942 | 108.583 |
| 14089.242 | 146.712 |
| 14091.742 | 127.169 |
| 14136.192 | 109.542 |
| 14139.282 | 99.146 |
| 14140.192 | 125.682 |
| 14141.392 | 122.966 |
| 14142.692 | 119.911 |
| 14145.192 | 87.717 |
| 14189.642 | 113.486 |
| 14192.732 | 130.789 |
| 14193.642 | 136.264 |
| 14194.842 | 89.039 |
| 14196.142 | 93.597 |
| 14198.642 | 147.761 |
| 14243.092 | 108.294 |
| 14246.182 | 96.437 |
| 14247.092 | 93.576 |
| 14248.292 | 107.279 |
| 14249.592 | 130.848 |
| 14252.092 | 122.176 |
| 14296.542 | 146.401 |
| 14299.632 | 92.295 |
| 14300.542 | 94.612 |
| 14301.742 | 114.972 |
| 14303.042 | 127.839 |
| 14305.542 | 122.438 |
| 14349.992 | 109.126 |
| 14353.082 | 120.242 |
| 14353.992 | 118.666 |
| 14355.192 | 81.188 |
| 14356.492 | 115.92 |
| 14358.992 | 119.006 |
| 14403.442 | 114.336 |
| 14406.532 | 114.174 |
| 14407.442 | 83.543 |
| 14408.642 | 114.567 |
| 14409.942 | 108.904 |
| 14412.442 | 137.832 |
| 14456.892 | 100.218 |
| 14459.982 | 126.797 |
| 14460.892 | 131.008 |
| 14462.092 | 95.258 |
| 14463.392 | 119.791 |
| 14465.892 | 105.458 |
| 14510.342 | 102.168 |
| 14513.432 | 130.463 |
| 14514.342 | 128.349 |
| 14515.542 | 115.417 |
| 14516.842 | 89.435 |
| 14519.342 | 98.94 |
| 14563.792 | 99.795 |
| 14566.882 | 112.598 |
| 14567.792 | 115.283 |
| 14568.992 | 127.819 |
| 14570.292 | 137.467 |
| 14572.792 | 100.613 |
| 14617.242 | 119.72 |
| 14620.332 | 113.341 |
| 14621.242 | 87.094 |
| 14622.442 | 128.888 |
| 14623.742 | 117.503 |
| 14626.242 | 106.851 |
| 14670.692 | 103.391 |
| 14673.782 | 112.48 |
| 14674.692 | 105.027 |
| 14675.892 | 125.698 |
| 14677.192 | 93.004 |
| 14679.692 | 138.937 |
| 14724.142 | 92.544 |
| 14727.232 | 107.999 |
| 14728.142 | 104.331 |
| 14729.342 | 146.657 |
| 14730.642 | 120.203 |
| 14733.142 | 145.518 |
| 14777.592 | 166.432 |
| 14780.682 | 107.34 |
| 14781.592 | 83.158 |
| 14782.792 | 126.873 |
| 14784.092 | 115.889 |
| 14786.592 | 133.602 |
| 14831.042 | 111.232 |
| 14834.132 | 106.007 |
| 14835.042 | 91.925 |
| 14836.242 | 102.614 |
| 14837.542 | 104.642 |
| 14840.042 | 111.606 |
| 14884.492 | 98.106 |
| 14887.582 | 104.424 |
| 14888.492 | 107.577 |
| 14889.692 | 97.09 |
| 14890.992 | 125.336 |
| 14893.492 | 136.069 |
| 14937.942 | 74.81 |
| 14941.032 | 105.405 |
| 14941.942 | 136.594 |
| 14943.142 | 126.586 |
| 14944.442 | 140.485 |
| 14946.942 | 137.343 |
| 14991.392 | 94.096 |
| 14994.482 | 111.177 |
| 14995.392 | 123.931 |
| 14996.592 | 124.85 |
| 14997.892 | 121.056 |
| 15000.392 | 127.13 |
| 15044.842 | 90.395 |
| 15047.932 | 112.752 |
| 15048.842 | 114.332 |
| 15050.042 | 131.757 |
| 15051.342 | 150.875 |
| 15053.842 | 91.896 |
| 15098.292 | 131.514 |
| 15101.382 | 103.019 |
| 15102.292 | 112.016 |
| 15103.492 | 104.325 |
| 15104.792 | 122.196 |
| 15107.292 | 98.511 |
| 15151.742 | 138.482 |
| 15154.832 | 118.6 |
| 15155.742 | 110.828 |
| 15156.942 | 125.183 |
| 15158.242 | 157.609 |
| 15160.742 | 99.169 |
| 15205.192 | 124.213 |
| 15208.282 | 117.901 |
| 15209.192 | 128.593 |
| 15210.392 | 118.464 |
| 15211.692 | 96.915 |
| 15214.192 | 130.884 |
| 15258.642 | 87.278 |
| 15261.732 | 128.733 |
| 15262.642 | 64.161 |
| 15263.842 | 107.166 |
| 15265.142 | 107.21 |
| 15267.642 | 110.73 |
| 15312.092 | 100.444 |
| 15315.182 | 137.659 |
| 15316.092 | 139.164 |
| 15317.292 | 132.055 |
| 15318.592 | 118.668 |
| 15321.092 | 111.027 |
| 15365.542 | 118.646 |
| 15368.632 | 180.877 |
| 15369.542 | 121.469 |
| 15370.742 | 131.614 |
| 15372.042 | 133.992 |
| 15374.542 | 99.004 |
| 15418.992 | 149.666 |
| 15422.082 | 125.9 |
| 15422.992 | 105.76 |
| 15424.192 | 104.013 |
| 15425.492 | 133.926 |
| 15427.992 | 109.083 |
| 15472.442 | 118.367 |
| 15475.532 | 124.699 |
| 15476.442 | 79.076 |
| 15477.642 | 139.408 |
| 15478.942 | 124.508 |
| 15481.442 | 135.136 |
| 15525.892 | 96.786 |
| 15528.982 | 150.113 |
| 15529.892 | 118.162 |
| 15531.092 | 143.379 |
| 15532.392 | 130.34 |
| 15534.892 | 138.616 |
| 15579.342 | 124.786 |
| 15582.432 | 94.723 |
| 15583.342 | 143.583 |
| 15584.542 | 179.177 |
| 15585.842 | 122.438 |
| 15588.342 | 157.967 |
| 15632.792 | 94.601 |
| 15635.882 | 135.783 |
| 15636.792 | 124.789 |
| 15637.992 | 102.631 |
| 15639.292 | 89.169 |
| 15641.792 | 108.856 |
| 15686.242 | 90.289 |
| 15689.332 | 136.106 |
| 15690.242 | 94.627 |
| 15691.442 | 136.325 |
| 15692.742 | 110.374 |
| 15695.242 | 130.59 |
| 15739.692 | 95.682 |
| 15742.782 | 139.897 |
| 15743.692 | 119.274 |
| 15744.892 | 96.732 |
| 15746.192 | 145.133 |
| 15748.692 | 89.066 |
| 15793.142 | 154.591 |
| 15796.232 | 78.532 |
| 15797.142 | 118.65 |
| 15798.342 | 134.113 |
| 15799.642 | 120.229 |
| 15802.142 | 150.751 |
| 15846.592 | 113.711 |
| 15849.682 | 93.359 |
| 15850.592 | 130.236 |
| 15851.792 | 109.275 |
| 15853.092 | 121.67 |
| 15855.592 | 103.024 |
| 15900.042 | 111.601 |
| 15903.132 | 107.716 |
| 15904.042 | 131.748 |
| 15905.242 | 115.963 |
| 15906.542 | 127.393 |
| 15909.042 | 121.61 |
| 15953.492 | 115.79 |
| 15956.582 | 113.11 |
| 15957.492 | 121.931 |
| 15958.692 | 120.338 |
| 15959.992 | 149.885 |
| 15962.492 | 116.536 |
| 16006.942 | 111.361 |
| 16010.032 | 157.491 |
| 16010.942 | 119.471 |
| 16012.142 | 118.104 |
| 16013.442 | 98.77 |
| 16015.942 | 97.22 |
| 16060.392 | 95.758 |
| 16063.482 | 111.474 |
| 16064.392 | 117.397 |
| 16065.592 | 116.061 |
| 16066.892 | 111.631 |
| 16069.392 | 132.185 |
| 16113.842 | 106.05 |
| 16116.932 | 129.673 |
| 16117.842 | 137.853 |
| 16119.042 | 124.1 |
| 16120.342 | 124.516 |
| 16122.842 | 120.18 |
| 16167.292 | 113.41 |
| 16170.382 | 109.491 |
| 16171.292 | 128.05 |
| 16172.492 | 104.459 |
| 16173.792 | 148.454 |
| 16176.292 | 106.767 |
| 16220.742 | 142.949 |
| 16223.832 | 112.923 |
| 16225.245 | 99.214 |
| 16226.245 | 112.687 |
| 16228.487 | 125.233 |
| 16230.987 | 93.191 |
| 16243.902 | 144.912 |
| 17079.502 | 84.934 |
| 17092.697 | 113.039 |
| 17095.787 | 89.696 |
| 17097.199 | 102.038 |
| 17098.199 | 95.758 |
| 17100.442 | 117.509 |
| 17102.942 | 90.699 |
| 17147.422 | 111.735 |
| 17150.512 | 152.095 |
| 17151.422 | 97.045 |
| 17152.622 | 143.993 |
| 17153.922 | 136.381 |
| 17156.422 | 116.955 |
| 17200.872 | 111.023 |
| 17203.962 | 143.265 |
| 17204.872 | 116.846 |
| 17206.072 | 74.125 |
| 17207.372 | 119.281 |
| 17209.872 | 121.537 |
| 17254.322 | 102.362 |
| 17257.412 | 103.58 |
| 17258.322 | 129.51 |
| 17259.522 | 98.221 |
| 17260.822 | 132.976 |
| 17263.322 | 113.21 |
| 17307.772 | 112.302 |
| 17310.862 | 117.37 |
| 17311.772 | 163.55 |
| 17312.972 | 133.298 |
| 17314.272 | 144.911 |
| 17316.772 | 105.778 |
| 17361.222 | 116.153 |
| 17364.312 | 117.026 |
| 17365.222 | 128.782 |
| 17366.422 | 110.398 |
| 17367.722 | 118.714 |
| 17370.222 | 116.865 |
| 17414.672 | 134.713 |
| 17417.762 | 134.462 |
| 17418.672 | 158.23 |
| 17419.872 | 149.065 |
| 17421.172 | 265.819 |
| 17423.672 | 128.034 |
| 17468.122 | 125.188 |
| 17471.212 | 113.744 |
| 17472.122 | 126.957 |
| 17473.322 | 127.191 |
| 17474.622 | 124.308 |
| 17477.122 | 100.64 |
| 17521.572 | 114.33 |
| 17524.662 | 106.398 |
| 17525.572 | 96.375 |
| 17526.772 | 115.924 |
| 17528.072 | 136.366 |
| 17530.572 | 123.185 |
| 17575.022 | 115.294 |
| 17578.112 | 117.654 |
| 17579.022 | 138.422 |
| 17580.222 | 139.749 |
| 17581.522 | 132.087 |
| 17584.022 | 120.702 |
| 17628.472 | 119.432 |
| 17631.562 | 107.692 |
| 17632.472 | 104.274 |
| 17633.672 | 134.758 |
| 17634.972 | 112.196 |
| 17637.472 | 109.501 |
| 17681.922 | 98.045 |
| 17685.012 | 107.616 |
| 17685.922 | 128.812 |
| 17687.122 | 90.719 |
| 17688.422 | 146.839 |
| 17690.922 | 141.098 |
| 17735.372 | 148.278 |
| 17738.462 | 120.605 |
| 17739.372 | 82.582 |
| 17740.572 | 80.129 |
| 17741.872 | 134.475 |
| 17744.372 | 130.252 |
| 17788.822 | 128.366 |
| 17791.912 | 112.047 |
| 17792.822 | 122.374 |
| 17794.022 | 109.814 |
| 17795.322 | 126.407 |
| 17797.822 | 117.178 |
| 17842.272 | 133.635 |
| 17845.362 | 109.203 |
| 17846.272 | 122.761 |
| 17847.472 | 134.576 |
| 17848.772 | 106.582 |
| 17851.272 | 90.859 |
| 17895.722 | 122.466 |
| 17898.812 | 113.478 |
| 17899.722 | 125.575 |
| 17900.922 | 143.862 |
| 17902.222 | 128.404 |
| 17904.722 | 138 |
| 17949.172 | 93.515 |
| 17952.262 | 102.336 |
| 17953.172 | 117.124 |
| 17954.372 | 121.284 |
| 17955.672 | 103.189 |
| 17958.172 | 130.369 |
| 18002.622 | 120.401 |
| 18005.712 | 127.766 |
| 18006.622 | 127.992 |
| 18007.822 | 117.529 |
| 18009.122 | 123.247 |
| 18011.622 | 119.422 |
| 18056.072 | 107.598 |
| 18059.162 | 118.45 |
| 18060.072 | 116.543 |
| 18061.272 | 144.167 |
| 18062.572 | 148.838 |
| 18065.072 | 126.712 |
| 18109.522 | 151.058 |
| 18112.612 | 108.085 |
| 18113.522 | 89.863 |
| 18114.722 | 107.637 |
| 18116.022 | 88.293 |
| 18118.522 | 115.862 |
| 18162.972 | 113.317 |
| 18166.062 | 118.411 |
| 18166.972 | 160.166 |
| 18168.172 | 105.638 |
| 18169.472 | 142.633 |
| 18171.972 | 148.501 |
| 18216.422 | 81.746 |
| 18219.512 | 107.891 |
| 18220.422 | 125.332 |
| 18221.622 | 119.58 |
| 18222.922 | 116.225 |
| 18225.422 | 110.872 |
| 18269.872 | 99.435 |
| 18272.962 | 129.534 |
| 18273.872 | 117.201 |
| 18275.072 | 127.432 |
| 18276.372 | 104.881 |
| 18278.872 | 118.815 |
| 18323.322 | 143.339 |
| 18326.412 | 134.611 |
| 18327.322 | 101.617 |
| 18328.522 | 108.918 |
| 18329.822 | 98.992 |
| 18332.322 | 140.822 |
| 18376.772 | 114.914 |
| 18379.862 | 107.265 |
| 18380.772 | 102.294 |
| 18381.972 | 98.085 |
| 18383.272 | 120.385 |
| 18385.772 | 98.217 |
| 18430.222 | 102.213 |
| 18433.312 | 112.029 |
| 18434.222 | 133.599 |
| 18435.422 | 88.858 |
| 18436.722 | 106.386 |
| 18439.222 | 108.762 |
| 18483.672 | 109.489 |
| 18486.762 | 139.37 |
| 18487.672 | 111.61 |
| 18488.872 | 92.67 |
| 18490.172 | 116.69 |
| 18492.672 | 106.416 |
| 18537.122 | 121.372 |
| 18540.212 | 109.2 |
| 18541.122 | 93.693 |
| 18542.322 | 109.169 |
| 18543.622 | 130.469 |
| 18546.122 | 102.067 |
| 18590.572 | 115.355 |
| 18593.662 | 130.211 |
| 18594.572 | 98.786 |
| 18595.772 | 109.782 |
| 18597.072 | 114.99 |
| 18599.572 | 103.199 |
| 18644.022 | 110.798 |
| 18647.112 | 114.748 |
| 18648.022 | 106.015 |
| 18649.222 | 107.694 |
| 18650.522 | 112.879 |
| 18653.022 | 107.136 |
| 18697.472 | 110.784 |
| 18700.562 | 116.324 |
| 18701.472 | 117.788 |
| 18702.672 | 122.845 |
| 18703.972 | 101.256 |
| 18706.472 | 106.824 |
| 18750.922 | 105.461 |
| 18754.012 | 113.256 |
| 18754.922 | 103.148 |
| 18756.122 | 97.541 |
| 18757.422 | 117.06 |
| 18759.922 | 108.456 |
| 18804.372 | 124.675 |
| 18807.462 | 110.952 |
| 18808.372 | 110.678 |
| 18809.572 | 106.589 |
| 18810.872 | 130.201 |
| 18813.372 | 110.666 |
| 18857.822 | 109.944 |
| 18860.912 | 104.198 |
| 18861.822 | 115.244 |
| 18863.022 | 98.308 |
| 18864.322 | 121.423 |
| 18866.822 | 160.348 |
| 18911.272 | 100.018 |
| 18914.362 | 93.02 |
| 18915.272 | 131.087 |
| 18916.472 | 130.439 |
| 18917.772 | 117.556 |
| 18920.272 | 94.423 |
| 18964.722 | 112.736 |
| 18967.812 | 102.483 |
| 18968.722 | 111.929 |
| 18969.922 | 103.87 |
| 18971.222 | 103.97 |
| 18973.722 | 97.281 |
| 19018.172 | 101.373 |
| 19021.262 | 106.492 |
| 19022.172 | 112.756 |
| 19023.372 | 111.832 |
| 19024.672 | 110.86 |
| 19027.172 | 109.796 |
| 19071.622 | 119.434 |
| 19074.712 | 132.832 |
| 19075.622 | 102.587 |
| 19076.822 | 109.07 |
| 19078.122 | 106.137 |
| 19080.622 | 86.527 |
| 19125.072 | 105.202 |
| 19128.162 | 108.63 |
| 19129.072 | 89.55 |
| 19130.272 | 77.29 |
| 19131.572 | 157.364 |
| 19134.072 | 119.523 |
| 19138.716 | 203.867 |
| 19143.966 | 204.716 |
| 19178.522 | 68.984 |
| 19181.612 | 95.686 |
| 19182.522 | 99.291 |
| 19183.722 | 134.376 |
| 19185.022 | 100.197 |
| 19187.522 | 78.487 |
| 19231.972 | 126.65 |
| 19235.062 | 104.245 |
| 19235.972 | 121.664 |
| 19237.172 | 82.797 |
| 19238.472 | 118 |
| 19240.972 | 98.328 |
| 19285.422 | 109.153 |
| 19288.512 | 120.428 |
| 19289.422 | 122.369 |
| 19290.622 | 102.947 |
| 19291.922 | 123.698 |
| 19294.422 | 103.548 |
| 19338.872 | 113.826 |
| 19341.962 | 127.653 |
| 19342.872 | 128.759 |
| 19344.072 | 136.443 |
| 19345.372 | 149.11 |
| 19347.872 | 90.72 |
| 19392.322 | 110.81 |
| 19395.412 | 114.251 |
| 19396.322 | 125.249 |
| 19397.522 | 94.179 |
| 19398.822 | 96.271 |
| 19401.322 | 123.145 |
| 19445.772 | 140.952 |
| 19448.862 | 89.939 |
| 19449.772 | 151.481 |
| 19450.972 | 91.846 |
| 19452.272 | 114.747 |
| 19453.162 | 102.767 |
| 19454.772 | 100.714 |
| 19455.662 | 111.716 |
| 19499.222 | 113.716 |
| 19502.312 | 114.536 |
| 19503.222 | 106.274 |
| 19504.422 | 119.91 |
| 19505.722 | 124.723 |
| 19508.222 | 104.643 |
| 19552.672 | 169.926 |
| 19555.762 | 96.67 |
| 19557.174 | 184.492 |
| 19558.174 | 117.073 |
| 19560.417 | 434.316 |
| 19562.917 | 248.18 |
| 19578.312 | 489.652 |
| 19580.612 | 224.678 |
| 19585.582 | 275.707 |
| 19587.782 | 171.762 |
| 19589.742 | 322.596 |
| 19592.632 | 252.043 |
| 19598.002 | 218.995 |
| 19602.962 | 176.685 |
| 19605.453 | 125.6 |
| 19608.543 | 95.169 |
| 19609.956 | 99.651 |
| 19610.956 | 110.104 |
| 19611.577 | 132.061 |
| 19613.198 | 138.912 |
| 19615.698 | 119.805 |
| 19644.518 | 198.64 |
| 19647.608 | 124.587 |
| 19649.021 | 289.337 |
| 19650.021 | 123.482 |
| 19651.662 | 275.087 |
| 19653.663 | 668.787 |
| 19656.163 | 165.992 |
| 19656.662 | 314.204 |
| 19659.162 | 309.937 |
| 19661.662 | 311.287 |
| 19664.162 | 291.657 |
| 19666.662 | 306.457 |
| 19669.162 | 668.864 |
| 19671.662 | 275.024 |
| 19674.162 | 448.569 |
| 19684.983 | 1081.333 |
| 19688.073 | 169.784 |
| 19689.486 | 234.474 |
| 19689.986 | 131.25 |
| 19692.728 | 204.15 |
| 19695.228 | 113.021 |
| 19708.343 | 220.378 |
| 19713.803 | 207.356 |
| 19719.003 | 219.818 |
| 19724.008 | 275.676 |
| 19727.138 | 228.198 |
| 19728.963 | 282.599 |
| 19730.163 | 185.079 |
| 19731.753 | 724.194 |
| 19735.303 | 690.292 |
| 20253.232 | 389.854 |
| 20257.201 | 1001.019 |
| 20258.574 | 214.452 |
| 20259.774 | 321.928 |
| 20261.816 | 181.19 |
| 20264.316 | 240.914 |
| 20269.322 | 189.348 |
| 20274.522 | 170.571 |
| 20279.982 | 186.393 |
| 20293.176 | 148.508 |
| 20296.266 | 224.324 |
| 20297.679 | 165.465 |
| 20298.679 | 254.301 |
| 20300.921 | 182.959 |
| 20303.421 | 461.593 |
| 20311.164 | 277.76 |
| 20314.164 | 256.163 |
| 20316.664 | 257.661 |
| 20319.164 | 365.306 |
| 20321.664 | 253.573 |
| 20324.164 | 200.327 |
| 20326.664 | 204.934 |
| 20329.164 | 207.24 |
| 20332.241 | 139.957 |
| 20332.364 | 154.262 |
| 20335.331 | 455.463 |
| 20336.744 | 155.881 |
| 20337.744 | 204.567 |
| 20340.812 | 129.368 |
| 20341.386 | 127.282 |
| 20343.886 | 110.62 |
| 20370.362 | 200.795 |
| 20372.706 | 130.466 |
| 20375.796 | 113.118 |
| 20377.209 | 103.184 |
| 20378.209 | 102.368 |
| 20380.451 | 96.873 |
| 20380.576 | 92.636 |
| 20382.951 | 94.58 |
| 20385.16 | 391.389 |
| 20390.16 | 168.112 |
| 20392.66 | 249.967 |
| 20398.22 | 264.967 |
| 20400.26 | 167.702 |
| 20402.66 | 145.908 |
| 20405.65 | 329.743 |
| 20409.86 | 359.27 |
| 20425.488 | 240.353 |
| 20428.578 | 516.553 |
| 20429.991 | 147.49 |
| 20430.991 | 174.552 |
| 20433.233 | 114.087 |
| 20433.36 | 124.134 |
| 20435.733 | 122.238 |
| 20480.213 | 112.077 |
| 20483.303 | 124.047 |
| 20484.213 | 95.015 |
| 20485.413 | 99.774 |
| 20486.713 | 81.615 |
| 20489.213 | 81.909 |
| 20533.663 | 97.764 |
| 20536.753 | 147.708 |
| 20537.663 | 124.361 |
| 20538.863 | 124.708 |
| 20540.163 | 111.288 |
| 20542.663 | 103.9 |
| 20587.113 | 117.496 |
| 20590.203 | 108.257 |
| 20591.113 | 117.139 |
| 20592.313 | 128.095 |
| 20593.613 | 105.308 |
| 20596.113 | 96.325 |
| 20640.563 | 89.315 |
| 20643.653 | 127.871 |
| 20644.563 | 131.532 |
| 20645.763 | 131.49 |
| 20647.063 | 95.331 |
| 20649.563 | 155.239 |
| 20694.013 | 135.509 |
| 20697.103 | 107.371 |
| 20698.013 | 155.92 |
| 20699.213 | 157.518 |
| 20700.513 | 142.341 |
| 20703.013 | 71.672 |
| 20747.463 | 132.249 |
| 20750.553 | 146.765 |
| 20751.463 | 122.871 |
| 20752.663 | 116.287 |
| 20753.963 | 124.965 |
| 20756.463 | 86.237 |
| 20800.913 | 137.186 |
| 20804.003 | 111.532 |
| 20804.913 | 160.308 |
| 20806.113 | 125.154 |
| 20807.413 | 161.551 |
| 20809.913 | 122.957 |
| 20854.363 | 78.272 |
| 20857.453 | 117.741 |
| 20858.363 | 90.736 |
| 20859.563 | 115.749 |
| 20860.863 | 110.832 |
| 20863.363 | 145.883 |
| 20907.813 | 142.915 |
| 20910.903 | 110.889 |
| 20911.813 | 122.582 |
| 20913.013 | 132.341 |
| 20914.313 | 137.848 |
| 20916.813 | 111.098 |
| 20961.263 | 101.15 |
| 20964.353 | 100.418 |
| 20965.263 | 140.011 |
| 20966.463 | 94.027 |
| 20967.763 | 106.695 |
| 20970.263 | 115.434 |
| 21014.713 | 88.57 |
| 21017.803 | 105.633 |
| 21018.713 | 124.452 |
| 21019.913 | 93.604 |
| 21021.213 | 132.44 |
| 21023.713 | 125.122 |
| 21068.163 | 120.85 |
| 21071.253 | 105.802 |
| 21072.163 | 122.05 |
| 21073.363 | 116.908 |
| 21074.663 | 104.236 |
| 21077.163 | 98.578 |
| 21121.613 | 113.133 |
| 21124.703 | 121.689 |
| 21125.613 | 114.708 |
| 21126.813 | 113.615 |
| 21128.113 | 105.75 |
| 21130.613 | 109.289 |
| 21175.063 | 134.414 |
| 21178.153 | 143.499 |
| 21179.063 | 112.897 |
| 21180.263 | 132.24 |
| 21181.563 | 133.788 |
| 21184.063 | 138.354 |
| 21228.513 | 107.726 |
| 21231.603 | 112.556 |
| 21232.513 | 115.551 |
| 21233.713 | 121.872 |
| 21235.013 | 132.072 |
| 21237.513 | 123.334 |
| 21281.963 | 131.546 |
| 21285.053 | 95.81 |
| 21285.963 | 108.003 |
| 21287.163 | 115.095 |
| 21288.463 | 152.306 |
| 21290.963 | 92.497 |
| 21335.413 | 135.431 |
| 21338.503 | 129.198 |
| 21339.413 | 99.796 |
| 21340.613 | 117.265 |
| 21341.913 | 143.851 |
| 21344.413 | 116.07 |
| 21388.863 | 156.89 |
| 21391.953 | 94.225 |
| 21392.863 | 141.782 |
| 21394.063 | 117.898 |
| 21395.363 | 160.219 |
| 21397.863 | 140.279 |
| 21442.313 | 129.196 |
| 21445.403 | 141.64 |
| 21446.313 | 136.69 |
| 21447.513 | 120.264 |
| 21448.813 | 96.57 |
| 21451.313 | 97.599 |
| 21495.763 | 112.34 |
| 21498.853 | 119.285 |
| 21499.763 | 86.9 |
| 21500.963 | 129.376 |
| 21502.263 | 154.131 |
| 21504.763 | 100.679 |
| 21549.213 | 99.737 |
| 21552.303 | 122.848 |
| 21553.213 | 87.819 |
| 21554.413 | 165.563 |
| 21555.713 | 102.063 |
| 21558.213 | 68.52 |
| 21602.663 | 119.598 |
| 21605.753 | 121.555 |
| 21606.663 | 81.627 |
| 21607.863 | 117.68 |
| 21609.163 | 144.013 |
| 21611.663 | 123.653 |
| 21656.113 | 147.508 |
| 21659.203 | 137.055 |
| 21660.113 | 114.86 |
| 21661.313 | 103.225 |
| 21662.613 | 115.949 |
| 21665.113 | 91.875 |
| 21709.563 | 104.998 |
| 21712.653 | 164.652 |
| 21713.563 | 136.289 |
| 21714.763 | 180.947 |
| 21716.063 | 139.852 |
| 21718.563 | 138.167 |
| 21763.013 | 155.801 |
| 21766.103 | 129.203 |
| 21767.013 | 98.745 |
| 21768.213 | 149.715 |
| 21769.513 | 120.309 |
| 21772.013 | 110.865 |
| 21816.463 | 121.475 |
| 21819.553 | 140.64 |
| 21820.463 | 123.532 |
| 21821.663 | 86.54 |
| 21822.963 | 135.885 |
| 21825.463 | 138.914 |
| 21869.913 | 133.578 |
| 21873.003 | 122.549 |
| 21873.913 | 103.106 |
| 21875.113 | 104.28 |
| 21876.413 | 99.165 |
| 21878.913 | 148.466 |
| 21923.363 | 101.599 |
| 21926.453 | 131.686 |
| 21927.363 | 139.631 |
| 21928.563 | 223.771 |
| 21929.863 | 77.154 |
| 21932.363 | 112.227 |
| 21976.813 | 129.922 |
| 21979.903 | 132.174 |
| 21980.813 | 115.909 |
| 21982.013 | 128.348 |
| 21983.313 | 136.6 |
| 21985.813 | 139.431 |
| 22030.263 | 100.805 |
| 22033.353 | 193.58 |
| 22034.263 | 129.973 |
| 22035.463 | 113.411 |
| 22036.763 | 72.853 |
| 22039.263 | 92.925 |
| 22083.713 | 108.425 |
| 22086.803 | 99.882 |
| 22087.713 | 109.462 |
| 22088.913 | 147.861 |
| 22090.213 | 106.618 |
| 22092.713 | 115.947 |
| 22137.163 | 61.303 |
| 22140.253 | 117.941 |
| 22141.163 | 117.496 |
| 22142.363 | 92.602 |
| 22143.663 | 126.917 |
| 22146.163 | 119.526 |
| 22190.613 | 131.687 |
| 22193.703 | 126.374 |
| 22194.613 | 130.611 |
| 22195.813 | 101.493 |
| 22197.113 | 190.951 |
| 22199.613 | 109.83 |
| 22244.063 | 119.488 |
| 22247.153 | 95.109 |
| 22248.063 | 100.867 |
| 22249.263 | 121.857 |
| 22250.563 | 145.816 |
| 22253.063 | 108.972 |
| 22297.513 | 118.258 |
| 22300.603 | 105.59 |
| 22301.513 | 124.083 |
| 22302.713 | 115.904 |
| 22304.013 | 134.113 |
| 22306.513 | 111.005 |
| 22350.963 | 121.439 |
| 22354.053 | 114.816 |
| 22354.963 | 101.351 |
| 22356.163 | 117.922 |
| 22357.463 | 106.591 |
| 22359.963 | 110.653 |
| 22404.413 | 109.656 |
| 22407.503 | 111.474 |
| 22408.413 | 104.597 |
| 22409.613 | 82.738 |
| 22410.913 | 111.793 |
| 22413.413 | 110.838 |
| 22457.863 | 108.563 |
| 22460.953 | 141.969 |
| 22461.863 | 98.179 |
| 22463.063 | 133.02 |
| 22464.363 | 108.035 |
| 22466.863 | 113.444 |
| 22511.313 | 87.75 |
| 22514.403 | 142.131 |
| 22515.313 | 179.23 |
| 22516.513 | 134.563 |
| 22517.813 | 144.18 |
| 22520.313 | 106.277 |
| 22564.763 | 112.015 |
| 22567.853 | 95.759 |
| 22568.763 | 112.676 |
| 22569.963 | 105.844 |
| 22571.263 | 126.183 |
| 22573.763 | 98.246 |
| 22618.213 | 125.806 |
| 22621.303 | 127.608 |
| 22622.213 | 117.383 |
| 22623.413 | 139.503 |
| 22624.713 | 177.259 |
| 22627.213 | 108.031 |
| 22671.663 | 121.673 |
| 22674.753 | 115.461 |
| 22675.663 | 117.866 |
| 22676.863 | 124.855 |
| 22678.163 | 100.699 |
| 22680.663 | 99.776 |
| 22725.113 | 150.211 |
| 22728.203 | 77.336 |
| 22729.113 | 143.975 |
| 22730.313 | 124.17 |
| 22731.613 | 129.834 |
| 22734.113 | 147.442 |
| 22778.563 | 108.547 |
| 22781.653 | 126.819 |
| 22782.563 | 101.833 |
| 22783.763 | 110.948 |
| 22785.063 | 102.489 |
| 22787.563 | 89.811 |
| 22832.013 | 116.332 |
| 22835.103 | 147.295 |
| 22836.013 | 116.188 |
| 22837.213 | 130.769 |
| 22838.513 | 123.595 |
| 22841.013 | 103.29 |
| 22885.463 | 117.676 |
| 22888.553 | 110.611 |
| 22889.434 | 127.053 |
| 22890.966 | 83.703 |
| 22893.208 | 94.928 |
| 22895.708 | 124 |
| 22905.454 | 112.87 |
| 22907.96 | 141.475 |
| 22911.406 | 89.219 |
| 22916.606 | 104.585 |
| 22921.602 | 110.619 |
| 22927.068 | 125.367 |
| 22932.268 | 94.455 |
| 23602.19 | 131.936 |
| 23607.392 | 137.065 |
| 23612.852 | 108.222 |
| 23616.502 | 135.744 |
| 23620.152 | 122.949 |
| 23623.802 | 499.676 |
| 23720.788 | 97.68 |
| 23725.988 | 131.327 |
| 23731.448 | 85.695 |
| 23736.448 | 83.882 |
| 23741.648 | 108.492 |
| 23744.223 | 143.319 |
| 23747.108 | 132.116 |
| 23757.417 | 84.241 |
| 23760.507 | 52.982 |
| 23761.92 | 116.459 |
| 23762.92 | 101.226 |
| 23765.162 | 100.453 |
| 23767.662 | 126.08 |
| 23812.143 | 104.931 |
| 23815.232 | 116.553 |
| 23816.143 | 92.583 |
| 23817.342 | 166.022 |
| 23818.643 | 111.222 |
| 23821.143 | 102.024 |
| 23865.592 | 118.669 |
| 23868.682 | 135.468 |
| 23869.592 | 118.284 |
| 23870.792 | 112.049 |
| 23872.092 | 101.573 |
| 23874.592 | 109.738 |
| 23919.042 | 123.611 |
| 23922.132 | 282.075 |
| 23923.042 | 127.09 |
| 23924.243 | 190.152 |
| 23925.542 | 103.35 |
| 23928.042 | 93.786 |
| 23972.493 | 128.247 |
| 23975.583 | 103.716 |
| 23976.493 | 70.673 |
| 23977.693 | 73.948 |
| 23978.993 | 140.853 |
| 23981.493 | 108.769 |
| 24025.943 | 91.918 |
| 24029.033 | 121.058 |
| 24029.943 | 89.165 |
| 24031.143 | 113.764 |
| 24032.443 | 135.105 |
| 24034.943 | 123.468 |
| 24079.393 | 133.554 |
| 24082.482 | 113.858 |
| 24083.393 | 159.012 |
| 24084.592 | 147.455 |
| 24085.893 | 106.041 |
| 24088.393 | 82.488 |
| 24132.842 | 112.893 |
| 24135.932 | 109.15 |
| 24136.842 | 115.853 |
| 24138.042 | 84.558 |
| 24139.342 | 118.933 |
| 24141.842 | 124.868 |
| 24186.292 | 119.936 |
| 24189.382 | 176.263 |
| 24190.292 | 136.29 |
| 24191.493 | 51.663 |
| 24192.792 | 114.678 |
| 24195.292 | 149.713 |
| 24239.743 | 94.349 |
| 24242.833 | 80.611 |
| 24243.743 | 79.347 |
| 24244.943 | 119.461 |
| 24246.243 | 95.986 |
| 24248.743 | 137.37 |
| 24293.193 | 88.731 |
| 24296.283 | 57.564 |
| 24297.193 | 147.013 |
| 24298.393 | 96.553 |
| 24299.693 | 95.591 |
| 24302.193 | 109.423 |
| 24346.643 | 63.764 |
| 24349.732 | 170.514 |
| 24350.643 | 131.921 |
| 24351.842 | 193.203 |
| 24353.143 | 107.469 |
| 24355.643 | 136.938 |
| 24400.092 | 77.832 |
| 24403.182 | 127.6 |
| 24404.092 | 69.583 |
| 24405.292 | 126.786 |
| 24406.592 | 126.473 |
| 24409.092 | 119.306 |
| 24453.542 | 154.411 |
| 24456.632 | 100.272 |
| 24457.542 | 101.893 |
| 24458.743 | 105.077 |
| 24460.042 | 138.641 |
| 24462.542 | 104.135 |
| 24506.993 | 132.654 |
| 24510.083 | 129.555 |
| 24510.993 | 87.959 |
| 24512.193 | 112.431 |
| 24513.493 | 148.917 |
| 24515.993 | 136.131 |
| 24560.443 | 85.929 |
| 24563.533 | 149.718 |
| 24564.443 | 84.655 |
| 24565.643 | 147.547 |
| 24566.943 | 143.971 |
| 24569.443 | 112.136 |
| 24613.893 | 96.085 |
| 24616.982 | 131.615 |
| 24617.893 | 121.246 |
| 24619.092 | 140.884 |
| 24620.393 | 110.894 |
| 24622.893 | 116.868 |
| 24667.342 | 142.951 |
| 24670.432 | 106.241 |
| 24671.342 | 90.802 |
| 24672.542 | 103.616 |
| 24673.842 | 101.641 |
| 24676.342 | 151.061 |
| 24720.792 | 100.508 |
| 24723.882 | 160.882 |
| 24724.792 | 133.58 |
| 24725.993 | 102.796 |
| 24727.292 | 132.196 |
| 24729.792 | 116.696 |
| 24774.243 | 118.412 |
| 24777.333 | 98.081 |
| 24778.243 | 164.223 |
| 24779.443 | 166.059 |
| 24780.743 | 72.889 |
| 24783.243 | 85.891 |
| 24827.693 | 118.279 |
| 24830.783 | 102.873 |
| 24831.693 | 136.114 |
| 24832.893 | 108.144 |
| 24834.193 | 108.175 |
| 24836.693 | 103.545 |
| 24881.143 | 141.473 |
| 24884.232 | 156.434 |
| 24885.143 | 45.74 |
| 24886.342 | 152.215 |
| 24887.643 | 145.437 |
| 24890.143 | 117.221 |
| 24934.592 | 108.03 |
| 24937.682 | 158.757 |
| 24938.592 | 79.111 |
| 24939.792 | 104.366 |
| 24941.092 | 130.554 |
| 24943.592 | 114.223 |
| 24988.042 | 109.665 |
| 24991.132 | 56.526 |
| 24992.042 | 111.612 |
| 24993.243 | 113.022 |
| 24994.542 | 43.483 |
| 24997.042 | 103.064 |
| 25041.493 | 120.645 |
| 25044.583 | 101.985 |
| 25045.493 | 129.668 |
| 25046.693 | 118.007 |
| 25047.993 | 110.606 |
| 25050.493 | 143.626 |
| 25094.943 | 129.795 |
| 25098.033 | 117.801 |
| 25098.943 | 130.585 |
| 25100.143 | 160.062 |
| 25101.443 | 209.489 |
| 25103.943 | 88.237 |
| 25148.393 | 133.909 |
| 25151.482 | 135.157 |
| 25152.393 | 113.103 |
| 25153.592 | 111.292 |
| 25154.893 | 131.195 |
| 25157.393 | 120.354 |
| 25201.842 | 56.146 |
| 25204.932 | 120.483 |
| 25205.842 | 116.583 |
| 25207.042 | 150.824 |
| 25208.342 | 99.963 |
| 25210.842 | 109.971 |
| 25255.292 | 107.035 |
| 25258.382 | 112.492 |
| 25259.292 | 149.699 |
| 25260.493 | 118.072 |
| 25261.792 | 140.576 |
| 25264.292 | 122.305 |
| 25308.743 | 99.881 |
| 25311.833 | 117.759 |
| 25312.743 | 85.658 |
| 25313.943 | 120.9 |
| 25315.243 | 132.136 |
| 25317.743 | 125.593 |
| 25362.193 | 106.861 |
| 25365.283 | 117.01 |
| 25366.193 | 177.061 |
| 25367.393 | 94.762 |
| 25368.693 | 131.796 |
| 25371.193 | 83.502 |
| 25415.643 | 71.451 |
| 25418.732 | 94.216 |
| 25419.643 | 126.69 |
| 25420.842 | 113.588 |
| 25422.143 | 129.871 |
| 25424.643 | 109.005 |
| 25469.092 | 148.541 |
| 25472.182 | 100.065 |
| 25473.092 | 147.418 |
| 25474.292 | 138.938 |
| 25475.592 | 117.781 |
| 25478.092 | 136.431 |
| 25522.542 | 146.259 |
| 25525.632 | 120.294 |
| 25526.542 | 132.417 |
| 25527.743 | 87.155 |
| 25529.042 | 151.29 |
| 25531.542 | 132.197 |
| 25575.993 | 64.954 |
| 25579.083 | 126.148 |
| 25579.993 | 128.429 |
| 25581.193 | 133.26 |
| 25582.493 | 112.407 |
| 25584.993 | 114.549 |
| 25629.443 | 151.286 |
| 25632.533 | 127.307 |
| 25633.443 | 115.541 |
| 25634.643 | 88.08 |
| 25635.943 | 108.247 |
| 25638.443 | 92.482 |
| 25682.893 | 106.241 |
| 25685.982 | 123.361 |
| 25686.893 | 117.735 |
| 25688.092 | 93.035 |
| 25689.393 | 139.761 |
| 25691.893 | 89.182 |
| 25736.342 | 120.767 |
| 25739.432 | 121.065 |
| 25740.342 | 143.516 |
| 25741.542 | 106.096 |
| 25742.842 | 119.443 |
| 25745.342 | 121.859 |
| 25789.792 | 110.689 |
| 25792.882 | 128.715 |
| 25793.792 | 152.63 |
| 25794.993 | 104.018 |
| 25796.292 | 99.531 |
| 25798.792 | 97.86 |
| 25843.243 | 66.332 |
| 25846.333 | 121.171 |
| 25847.243 | 110.239 |
| 25848.443 | 139.261 |
| 25849.743 | 176.449 |
| 25852.243 | 174.201 |
| 25896.693 | 111.368 |
| 25899.783 | 153.521 |
| 25900.693 | 141.209 |
| 25901.893 | 106.431 |
| 25903.193 | 164.068 |
| 25905.693 | 116.799 |
| 25950.143 | 169.409 |
| 25953.232 | 257.062 |
| 25954.143 | 177.017 |
| 25955.342 | 118.521 |
| 25956.643 | 171.794 |
| 25959.143 | 153.433 |
| 26003.592 | 127.408 |
| 26006.682 | 110.227 |
| 26007.592 | 176.14 |
| 26008.792 | 67.791 |
| 26010.092 | 182.256 |
| 26012.592 | 117.77 |
| 26057.042 | 139.273 |
| 26060.132 | 131.964 |
| 26061.042 | 119.263 |
| 26062.243 | 123.477 |
| 26063.542 | 89.545 |
| 26066.042 | 58.449 |
| 26110.493 | 77.783 |
| 26113.583 | 132.186 |
| 26114.493 | 131.265 |
| 26115.693 | 99.512 |
| 26116.993 | 128.171 |
| 26119.072 | 117.881 |
| 26119.493 | 108.689 |
| 26121.102 | 73.272 |
| 26163.943 | 121.468 |
| 26167.033 | 131.873 |
| 26167.943 | 131.059 |
| 26187.4883738109 | 125.539 |
| 26196.3552750333 | 125.581 |
| 26205.2221762558 | 125.622 |
| 26214.0890774782 | 125.663 |
| 26222.9559787007 | 125.704 |
| 26231.8228799231 | 125.746 |
| 26240.6897811456 | 125.787 |
| 26249.556682368 | 125.828 |
| 26258.4235835904 | 125.869 |
| 26267.2904848129 | 125.91 |
| 26276.1573860353 | 125.952 |
| 26285.0242872578 | 125.993 |
| 26293.8911884802 | 126.034 |
| 26302.7580897026 | 126.075 |
| 26311.6249909251 | 126.116 |
| 26320.4918921475 | 126.158 |
| 26329.35879337 | 126.199 |
| 26338.2256945924 | 126.24 |
| 26347.0925958149 | 126.281 |
| 26355.9594970373 | 126.322 |
| 26364.8263982597 | 126.364 |
| 26373.6932994822 | 126.405 |
| 26382.5602007046 | 126.446 |
| 26391.4271019271 | 126.487 |
| 26400.2940031495 | 126.528 |
| 26409.1609043719 | 126.57 |
| 26418.0278055944 | 126.611 |
| 26426.8947068168 | 126.652 |
| 26435.7616080393 | 126.693 |
| 26444.6285092617 | 126.735 |
| 26453.4954104842 | 126.776 |
| 26462.3623117066 | 126.817 |
| 26471.229212929 | 126.858 |
| 26480.0961141515 | 126.899 |
| 26488.9630153739 | 126.941 |
| 26497.8299165964 | 126.982 |
| 26506.6968178188 | 127.023 |
| 26515.5637190412 | 127.064 |
| 26524.4306202637 | 127.105 |
| 26533.2975214861 | 127.147 |
| 26542.1644227086 | 127.188 |
| 26551.031323931 | 127.229 |
| 26559.8982251535 | 127.27 |
| 26568.7651263759 | 127.311 |
| 26577.6320275983 | 127.353 |
| 26586.4989288208 | 127.394 |
| 26595.3658300432 | 127.435 |
| 26604.2327312657 | 127.476 |
| 26613.0996324881 | 127.517 |
| 26621.9665337105 | 127.559 |
| 26630.833434933 | 127.6 |
| 26639.7003361554 | 127.641 |
| 26648.5672373779 | 127.682 |
| 26657.4341386003 | 127.724 |
| 26666.3010398228 | 127.765 |
| 26675.1679410452 | 127.806 |
| 26684.0348422676 | 127.847 |
| 26692.9017434901 | 127.888 |
| 26701.7686447125 | 127.93 |
| 26710.635545935 | 127.971 |
| 26719.5024471574 | 128.012 |
| 26728.3693483798 | 128.053 |
| 26737.2362496023 | 128.094 |
| 26746.1031508247 | 128.136 |
| 26754.9700520472 | 128.177 |
| 26763.8369532696 | 128.218 |
| 26772.7038544921 | 128.259 |
| 26781.5707557145 | 128.3 |
| 26790.4376569369 | 128.342 |
| 26799.3045581594 | 128.383 |
| 26808.1714593818 | 128.424 |
| 26817.0383606043 | 128.465 |
| 26825.9052618267 | 128.506 |
| 26834.7721630491 | 128.548 |
| 26843.6390642716 | 128.589 |
| 26852.505965494 | 128.63 |
| 26861.3728667165 | 128.671 |
| 26870.2397679389 | 128.712 |
| 26879.1066691614 | 128.754 |
| 26887.9735703838 | 128.795 |
| 26896.8404716062 | 128.836 |
| 26905.7073728287 | 128.877 |
| 26914.5742740511 | 128.919 |
| 26923.4411752736 | 128.96 |
| 26932.308076496 | 129.001 |
| 26941.1749777184 | 129.042 |
| 26950.0418789409 | 129.083 |
| 26958.9087801633 | 129.125 |
| 26967.7756813858 | 129.166 |
| 26976.6425826082 | 129.207 |
| 26985.5094838307 | 129.248 |
| 26994.3763850531 | 129.289 |
| 27003.2432862755 | 129.331 |
| 27012.110187498 | 129.372 |
| 27020.9770887204 | 129.413 |
| 27029.8439899429 | 129.454 |
| 27038.7108911653 | 129.495 |
| 27047.5777923877 | 129.537 |
| 27056.4446936102 | 129.578 |
| 27065.3115948326 | 129.619 |
| 27074.1784960551 | 129.66 |
| 27083.0453972775 | 129.701 |
| 27091.9122985 | 129.743 |
| 27100.7791997224 | 129.784 |
| 27109.6461009448 | 129.825 |
| 27118.5130021673 | 129.866 |
| 27127.3799033897 | 129.908 |
| 27136.2468046122 | 129.949 |
| 27145.1137058346 | 129.99 |
| 27153.980607057 | 130.031 |
| 27162.8475082795 | 130.072 |
| 27171.7144095019 | 130.114 |
| 27180.5813107244 | 130.155 |
| 27189.4482119468 | 130.196 |
| 27198.3151131693 | 130.237 |
| 27207.1820143917 | 130.278 |
| 27216.0489156141 | 130.32 |
| 27224.9158168366 | 130.361 |
| 27233.782718059 | 130.402 |
| 27242.6496192815 | 130.443 |
| 27251.5165205039 | 130.484 |